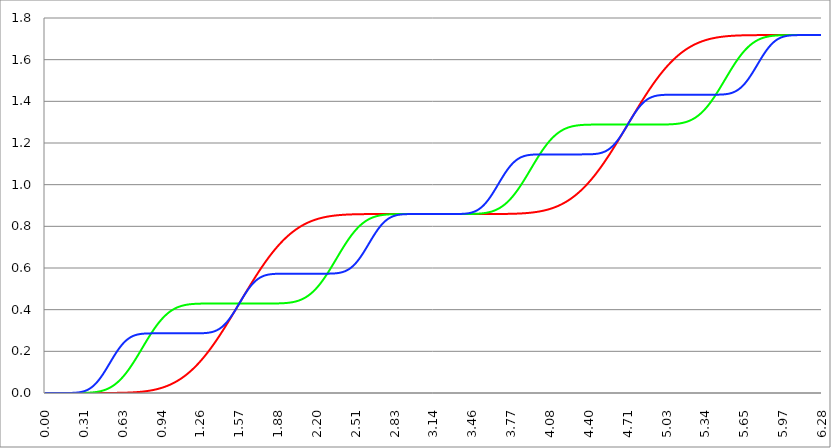
| Category | Series 1 | Series 0 | Series 2 |
|---|---|---|---|
| 0.0 | 0 | 0 | 0 |
| 0.00314159265358979 | 0 | 0 | 0 |
| 0.00628318530717958 | 0 | 0 | 0 |
| 0.00942477796076938 | 0 | 0 | 0 |
| 0.0125663706143592 | 0 | 0 | 0 |
| 0.015707963267949 | 0 | 0 | 0 |
| 0.0188495559215388 | 0 | 0 | 0 |
| 0.0219911485751285 | 0 | 0 | 0 |
| 0.0251327412287183 | 0 | 0 | 0 |
| 0.0282743338823081 | 0 | 0 | 0 |
| 0.0314159265358979 | 0 | 0 | 0 |
| 0.0345575191894877 | 0 | 0 | 0 |
| 0.0376991118430775 | 0 | 0 | 0 |
| 0.0408407044966673 | 0 | 0 | 0 |
| 0.0439822971502571 | 0 | 0 | 0 |
| 0.0471238898038469 | 0 | 0 | 0 |
| 0.0502654824574367 | 0 | 0 | 0 |
| 0.0534070751110265 | 0 | 0 | 0 |
| 0.0565486677646163 | 0 | 0 | 0 |
| 0.059690260418206 | 0 | 0 | 0 |
| 0.0628318530717958 | 0 | 0 | 0 |
| 0.0659734457253856 | 0 | 0 | 0 |
| 0.0691150383789754 | 0 | 0 | 0 |
| 0.0722566310325652 | 0 | 0 | 0 |
| 0.075398223686155 | 0 | 0 | 0 |
| 0.0785398163397448 | 0 | 0 | 0 |
| 0.0816814089933346 | 0 | 0 | 0 |
| 0.0848230016469244 | 0 | 0 | 0 |
| 0.0879645943005142 | 0 | 0 | 0 |
| 0.091106186954104 | 0 | 0 | 0 |
| 0.0942477796076937 | 0 | 0 | 0 |
| 0.0973893722612835 | 0 | 0 | 0 |
| 0.100530964914873 | 0 | 0 | 0 |
| 0.103672557568463 | 0 | 0 | 0 |
| 0.106814150222053 | 0 | 0 | 0 |
| 0.109955742875643 | 0 | 0 | 0 |
| 0.113097335529233 | 0 | 0 | 0 |
| 0.116238928182822 | 0 | 0 | 0 |
| 0.119380520836412 | 0 | 0 | 0 |
| 0.122522113490002 | 0 | 0 | 0 |
| 0.125663706143592 | 0 | 0 | 0 |
| 0.128805298797181 | 0 | 0 | 0 |
| 0.131946891450771 | 0 | 0 | 0 |
| 0.135088484104361 | 0 | 0 | 0 |
| 0.138230076757951 | 0 | 0 | 0 |
| 0.141371669411541 | 0 | 0 | 0 |
| 0.14451326206513 | 0 | 0 | 0 |
| 0.14765485471872 | 0 | 0 | 0 |
| 0.15079644737231 | 0 | 0 | 0 |
| 0.1539380400259 | 0 | 0 | 0 |
| 0.15707963267949 | 0 | 0 | 0 |
| 0.160221225333079 | 0 | 0 | 0 |
| 0.163362817986669 | 0 | 0 | 0 |
| 0.166504410640259 | 0 | 0 | 0 |
| 0.169646003293849 | 0 | 0 | 0 |
| 0.172787595947439 | 0 | 0 | 0 |
| 0.175929188601028 | 0 | 0 | 0 |
| 0.179070781254618 | 0 | 0 | 0 |
| 0.182212373908208 | 0 | 0 | 0 |
| 0.185353966561798 | 0 | 0 | 0 |
| 0.188495559215388 | 0 | 0 | 0 |
| 0.191637151868977 | 0 | 0 | 0 |
| 0.194778744522567 | 0 | 0 | 0 |
| 0.197920337176157 | 0 | 0 | 0 |
| 0.201061929829747 | 0 | 0 | 0 |
| 0.204203522483336 | 0 | 0 | 0 |
| 0.207345115136926 | 0 | 0 | 0 |
| 0.210486707790516 | 0 | 0 | 0 |
| 0.213628300444106 | 0 | 0 | 0 |
| 0.216769893097696 | 0 | 0 | 0 |
| 0.219911485751285 | 0 | 0 | 0.001 |
| 0.223053078404875 | 0 | 0 | 0.001 |
| 0.226194671058465 | 0 | 0 | 0.001 |
| 0.229336263712055 | 0 | 0 | 0.001 |
| 0.232477856365645 | 0 | 0 | 0.001 |
| 0.235619449019234 | 0 | 0 | 0.001 |
| 0.238761041672824 | 0 | 0 | 0.001 |
| 0.241902634326414 | 0 | 0 | 0.001 |
| 0.245044226980004 | 0 | 0 | 0.001 |
| 0.248185819633594 | 0 | 0 | 0.001 |
| 0.251327412287183 | 0 | 0 | 0.002 |
| 0.254469004940773 | 0 | 0 | 0.002 |
| 0.257610597594363 | 0 | 0 | 0.002 |
| 0.260752190247953 | 0 | 0 | 0.002 |
| 0.263893782901543 | 0 | 0 | 0.002 |
| 0.267035375555132 | 0 | 0 | 0.002 |
| 0.270176968208722 | 0 | 0 | 0.003 |
| 0.273318560862312 | 0 | 0 | 0.003 |
| 0.276460153515902 | 0 | 0 | 0.003 |
| 0.279601746169492 | 0 | 0 | 0.004 |
| 0.282743338823082 | 0 | 0 | 0.004 |
| 0.285884931476671 | 0 | 0 | 0.004 |
| 0.289026524130261 | 0 | 0 | 0.004 |
| 0.292168116783851 | 0 | 0 | 0.005 |
| 0.295309709437441 | 0 | 0 | 0.005 |
| 0.298451302091031 | 0 | 0 | 0.006 |
| 0.30159289474462 | 0 | 0 | 0.006 |
| 0.30473448739821 | 0 | 0 | 0.007 |
| 0.3078760800518 | 0 | 0 | 0.007 |
| 0.31101767270539 | 0 | 0.001 | 0.008 |
| 0.31415926535898 | 0 | 0.001 | 0.008 |
| 0.31730085801257 | 0 | 0.001 | 0.009 |
| 0.320442450666159 | 0 | 0.001 | 0.009 |
| 0.323584043319749 | 0 | 0.001 | 0.01 |
| 0.326725635973339 | 0 | 0.001 | 0.011 |
| 0.329867228626929 | 0 | 0.001 | 0.011 |
| 0.333008821280519 | 0 | 0.001 | 0.012 |
| 0.336150413934108 | 0 | 0.001 | 0.013 |
| 0.339292006587698 | 0 | 0.001 | 0.014 |
| 0.342433599241288 | 0 | 0.001 | 0.015 |
| 0.345575191894878 | 0 | 0.001 | 0.016 |
| 0.348716784548468 | 0 | 0.001 | 0.017 |
| 0.351858377202058 | 0 | 0.001 | 0.018 |
| 0.354999969855647 | 0 | 0.001 | 0.019 |
| 0.358141562509237 | 0 | 0.002 | 0.02 |
| 0.361283155162827 | 0 | 0.002 | 0.021 |
| 0.364424747816417 | 0 | 0.002 | 0.022 |
| 0.367566340470007 | 0 | 0.002 | 0.023 |
| 0.370707933123597 | 0 | 0.002 | 0.025 |
| 0.373849525777186 | 0 | 0.002 | 0.026 |
| 0.376991118430776 | 0 | 0.002 | 0.027 |
| 0.380132711084366 | 0 | 0.003 | 0.029 |
| 0.383274303737956 | 0 | 0.003 | 0.03 |
| 0.386415896391546 | 0 | 0.003 | 0.032 |
| 0.389557489045135 | 0 | 0.003 | 0.033 |
| 0.392699081698725 | 0 | 0.003 | 0.035 |
| 0.395840674352315 | 0 | 0.003 | 0.037 |
| 0.398982267005905 | 0 | 0.004 | 0.039 |
| 0.402123859659495 | 0 | 0.004 | 0.04 |
| 0.405265452313085 | 0 | 0.004 | 0.042 |
| 0.408407044966674 | 0 | 0.004 | 0.044 |
| 0.411548637620264 | 0 | 0.005 | 0.046 |
| 0.414690230273854 | 0 | 0.005 | 0.048 |
| 0.417831822927444 | 0 | 0.005 | 0.05 |
| 0.420973415581034 | 0 | 0.005 | 0.052 |
| 0.424115008234623 | 0 | 0.006 | 0.054 |
| 0.427256600888213 | 0 | 0.006 | 0.057 |
| 0.430398193541803 | 0 | 0.006 | 0.059 |
| 0.433539786195393 | 0 | 0.007 | 0.061 |
| 0.436681378848983 | 0 | 0.007 | 0.064 |
| 0.439822971502573 | 0 | 0.007 | 0.066 |
| 0.442964564156162 | 0 | 0.008 | 0.068 |
| 0.446106156809752 | 0 | 0.008 | 0.071 |
| 0.449247749463342 | 0 | 0.009 | 0.073 |
| 0.452389342116932 | 0 | 0.009 | 0.076 |
| 0.455530934770522 | 0 | 0.01 | 0.079 |
| 0.458672527424111 | 0 | 0.01 | 0.081 |
| 0.461814120077701 | 0 | 0.011 | 0.084 |
| 0.464955712731291 | 0 | 0.011 | 0.087 |
| 0.468097305384881 | 0 | 0.012 | 0.09 |
| 0.471238898038471 | 0 | 0.012 | 0.092 |
| 0.474380490692061 | 0 | 0.013 | 0.095 |
| 0.47752208334565 | 0 | 0.013 | 0.098 |
| 0.48066367599924 | 0 | 0.014 | 0.101 |
| 0.48380526865283 | 0 | 0.015 | 0.104 |
| 0.48694686130642 | 0 | 0.015 | 0.107 |
| 0.49008845396001 | 0 | 0.016 | 0.11 |
| 0.493230046613599 | 0 | 0.017 | 0.113 |
| 0.496371639267189 | 0 | 0.018 | 0.116 |
| 0.499513231920779 | 0 | 0.018 | 0.119 |
| 0.502654824574369 | 0 | 0.019 | 0.122 |
| 0.505796417227959 | 0 | 0.02 | 0.125 |
| 0.508938009881549 | 0 | 0.021 | 0.129 |
| 0.512079602535138 | 0 | 0.022 | 0.132 |
| 0.515221195188728 | 0 | 0.023 | 0.135 |
| 0.518362787842318 | 0 | 0.024 | 0.138 |
| 0.521504380495908 | 0 | 0.025 | 0.141 |
| 0.524645973149498 | 0 | 0.026 | 0.144 |
| 0.527787565803087 | 0 | 0.027 | 0.147 |
| 0.530929158456677 | 0 | 0.028 | 0.15 |
| 0.534070751110267 | 0 | 0.029 | 0.154 |
| 0.537212343763857 | 0 | 0.03 | 0.157 |
| 0.540353936417447 | 0 | 0.031 | 0.16 |
| 0.543495529071037 | 0 | 0.032 | 0.163 |
| 0.546637121724626 | 0 | 0.033 | 0.166 |
| 0.549778714378216 | 0 | 0.035 | 0.169 |
| 0.552920307031806 | 0 | 0.036 | 0.172 |
| 0.556061899685396 | 0 | 0.037 | 0.175 |
| 0.559203492338986 | 0 | 0.038 | 0.178 |
| 0.562345084992576 | 0 | 0.04 | 0.181 |
| 0.565486677646165 | 0 | 0.041 | 0.184 |
| 0.568628270299755 | 0 | 0.043 | 0.187 |
| 0.571769862953345 | 0.001 | 0.044 | 0.19 |
| 0.574911455606935 | 0.001 | 0.046 | 0.193 |
| 0.578053048260525 | 0.001 | 0.047 | 0.196 |
| 0.581194640914114 | 0.001 | 0.049 | 0.199 |
| 0.584336233567704 | 0.001 | 0.05 | 0.201 |
| 0.587477826221294 | 0.001 | 0.052 | 0.204 |
| 0.590619418874884 | 0.001 | 0.054 | 0.207 |
| 0.593761011528474 | 0.001 | 0.055 | 0.209 |
| 0.596902604182064 | 0.001 | 0.057 | 0.212 |
| 0.600044196835653 | 0.001 | 0.059 | 0.215 |
| 0.603185789489243 | 0.001 | 0.061 | 0.217 |
| 0.606327382142833 | 0.001 | 0.062 | 0.22 |
| 0.609468974796423 | 0.001 | 0.064 | 0.222 |
| 0.612610567450013 | 0.001 | 0.066 | 0.224 |
| 0.615752160103602 | 0.001 | 0.068 | 0.227 |
| 0.618893752757192 | 0.001 | 0.07 | 0.229 |
| 0.622035345410782 | 0.001 | 0.072 | 0.231 |
| 0.625176938064372 | 0.001 | 0.074 | 0.233 |
| 0.628318530717962 | 0.001 | 0.076 | 0.235 |
| 0.631460123371551 | 0.001 | 0.078 | 0.238 |
| 0.634601716025141 | 0.001 | 0.081 | 0.24 |
| 0.637743308678731 | 0.001 | 0.083 | 0.242 |
| 0.640884901332321 | 0.001 | 0.085 | 0.243 |
| 0.644026493985911 | 0.001 | 0.087 | 0.245 |
| 0.647168086639501 | 0.001 | 0.089 | 0.247 |
| 0.65030967929309 | 0.001 | 0.092 | 0.249 |
| 0.65345127194668 | 0.002 | 0.094 | 0.251 |
| 0.65659286460027 | 0.002 | 0.097 | 0.252 |
| 0.65973445725386 | 0.002 | 0.099 | 0.254 |
| 0.66287604990745 | 0.002 | 0.101 | 0.255 |
| 0.666017642561039 | 0.002 | 0.104 | 0.257 |
| 0.669159235214629 | 0.002 | 0.106 | 0.258 |
| 0.672300827868219 | 0.002 | 0.109 | 0.26 |
| 0.675442420521809 | 0.002 | 0.112 | 0.261 |
| 0.678584013175399 | 0.002 | 0.114 | 0.262 |
| 0.681725605828989 | 0.002 | 0.117 | 0.264 |
| 0.684867198482578 | 0.002 | 0.119 | 0.265 |
| 0.688008791136168 | 0.002 | 0.122 | 0.266 |
| 0.691150383789758 | 0.002 | 0.125 | 0.267 |
| 0.694291976443348 | 0.002 | 0.128 | 0.268 |
| 0.697433569096938 | 0.003 | 0.13 | 0.269 |
| 0.700575161750528 | 0.003 | 0.133 | 0.27 |
| 0.703716754404117 | 0.003 | 0.136 | 0.271 |
| 0.706858347057707 | 0.003 | 0.139 | 0.272 |
| 0.709999939711297 | 0.003 | 0.142 | 0.273 |
| 0.713141532364887 | 0.003 | 0.144 | 0.274 |
| 0.716283125018477 | 0.003 | 0.147 | 0.275 |
| 0.719424717672066 | 0.003 | 0.15 | 0.275 |
| 0.722566310325656 | 0.003 | 0.153 | 0.276 |
| 0.725707902979246 | 0.003 | 0.156 | 0.277 |
| 0.728849495632836 | 0.004 | 0.159 | 0.277 |
| 0.731991088286426 | 0.004 | 0.162 | 0.278 |
| 0.735132680940016 | 0.004 | 0.165 | 0.279 |
| 0.738274273593605 | 0.004 | 0.168 | 0.279 |
| 0.741415866247195 | 0.004 | 0.171 | 0.28 |
| 0.744557458900785 | 0.004 | 0.174 | 0.28 |
| 0.747699051554375 | 0.004 | 0.177 | 0.281 |
| 0.750840644207965 | 0.005 | 0.18 | 0.281 |
| 0.753982236861554 | 0.005 | 0.184 | 0.281 |
| 0.757123829515144 | 0.005 | 0.187 | 0.282 |
| 0.760265422168734 | 0.005 | 0.19 | 0.282 |
| 0.763407014822324 | 0.005 | 0.193 | 0.282 |
| 0.766548607475914 | 0.005 | 0.196 | 0.283 |
| 0.769690200129504 | 0.006 | 0.199 | 0.283 |
| 0.772831792783093 | 0.006 | 0.202 | 0.283 |
| 0.775973385436683 | 0.006 | 0.205 | 0.284 |
| 0.779114978090273 | 0.006 | 0.208 | 0.284 |
| 0.782256570743863 | 0.006 | 0.212 | 0.284 |
| 0.785398163397453 | 0.006 | 0.215 | 0.284 |
| 0.788539756051042 | 0.007 | 0.218 | 0.284 |
| 0.791681348704632 | 0.007 | 0.221 | 0.285 |
| 0.794822941358222 | 0.007 | 0.224 | 0.285 |
| 0.797964534011812 | 0.007 | 0.227 | 0.285 |
| 0.801106126665402 | 0.007 | 0.23 | 0.285 |
| 0.804247719318992 | 0.008 | 0.234 | 0.285 |
| 0.807389311972581 | 0.008 | 0.237 | 0.285 |
| 0.810530904626171 | 0.008 | 0.24 | 0.285 |
| 0.813672497279761 | 0.008 | 0.243 | 0.285 |
| 0.816814089933351 | 0.009 | 0.246 | 0.286 |
| 0.819955682586941 | 0.009 | 0.249 | 0.286 |
| 0.823097275240531 | 0.009 | 0.252 | 0.286 |
| 0.82623886789412 | 0.009 | 0.255 | 0.286 |
| 0.82938046054771 | 0.01 | 0.258 | 0.286 |
| 0.8325220532013 | 0.01 | 0.261 | 0.286 |
| 0.83566364585489 | 0.01 | 0.264 | 0.286 |
| 0.83880523850848 | 0.011 | 0.267 | 0.286 |
| 0.841946831162069 | 0.011 | 0.27 | 0.286 |
| 0.845088423815659 | 0.011 | 0.273 | 0.286 |
| 0.848230016469249 | 0.011 | 0.276 | 0.286 |
| 0.851371609122839 | 0.012 | 0.279 | 0.286 |
| 0.854513201776429 | 0.012 | 0.282 | 0.286 |
| 0.857654794430019 | 0.012 | 0.285 | 0.286 |
| 0.860796387083608 | 0.013 | 0.288 | 0.286 |
| 0.863937979737198 | 0.013 | 0.291 | 0.286 |
| 0.867079572390788 | 0.013 | 0.294 | 0.286 |
| 0.870221165044378 | 0.014 | 0.296 | 0.286 |
| 0.873362757697968 | 0.014 | 0.299 | 0.286 |
| 0.876504350351557 | 0.015 | 0.302 | 0.286 |
| 0.879645943005147 | 0.015 | 0.305 | 0.286 |
| 0.882787535658737 | 0.015 | 0.307 | 0.286 |
| 0.885929128312327 | 0.016 | 0.31 | 0.286 |
| 0.889070720965917 | 0.016 | 0.313 | 0.286 |
| 0.892212313619507 | 0.017 | 0.315 | 0.286 |
| 0.895353906273096 | 0.017 | 0.318 | 0.286 |
| 0.898495498926686 | 0.017 | 0.321 | 0.286 |
| 0.901637091580276 | 0.018 | 0.323 | 0.286 |
| 0.904778684233866 | 0.018 | 0.326 | 0.286 |
| 0.907920276887456 | 0.019 | 0.328 | 0.286 |
| 0.911061869541045 | 0.019 | 0.331 | 0.286 |
| 0.914203462194635 | 0.02 | 0.333 | 0.286 |
| 0.917345054848225 | 0.02 | 0.335 | 0.286 |
| 0.920486647501815 | 0.021 | 0.338 | 0.286 |
| 0.923628240155405 | 0.021 | 0.34 | 0.286 |
| 0.926769832808995 | 0.022 | 0.342 | 0.286 |
| 0.929911425462584 | 0.022 | 0.345 | 0.286 |
| 0.933053018116174 | 0.023 | 0.347 | 0.286 |
| 0.936194610769764 | 0.023 | 0.349 | 0.286 |
| 0.939336203423354 | 0.024 | 0.351 | 0.286 |
| 0.942477796076944 | 0.025 | 0.353 | 0.286 |
| 0.945619388730533 | 0.025 | 0.355 | 0.286 |
| 0.948760981384123 | 0.026 | 0.357 | 0.286 |
| 0.951902574037713 | 0.026 | 0.359 | 0.286 |
| 0.955044166691303 | 0.027 | 0.361 | 0.286 |
| 0.958185759344893 | 0.028 | 0.363 | 0.286 |
| 0.961327351998483 | 0.028 | 0.365 | 0.286 |
| 0.964468944652072 | 0.029 | 0.367 | 0.286 |
| 0.967610537305662 | 0.03 | 0.369 | 0.286 |
| 0.970752129959252 | 0.03 | 0.371 | 0.286 |
| 0.973893722612842 | 0.031 | 0.373 | 0.286 |
| 0.977035315266432 | 0.032 | 0.374 | 0.286 |
| 0.980176907920022 | 0.032 | 0.376 | 0.286 |
| 0.983318500573611 | 0.033 | 0.378 | 0.286 |
| 0.986460093227201 | 0.034 | 0.379 | 0.286 |
| 0.989601685880791 | 0.034 | 0.381 | 0.286 |
| 0.992743278534381 | 0.035 | 0.382 | 0.286 |
| 0.995884871187971 | 0.036 | 0.384 | 0.286 |
| 0.99902646384156 | 0.037 | 0.385 | 0.286 |
| 1.00216805649515 | 0.038 | 0.387 | 0.286 |
| 1.00530964914874 | 0.038 | 0.388 | 0.286 |
| 1.00845124180233 | 0.039 | 0.39 | 0.286 |
| 1.01159283445592 | 0.04 | 0.391 | 0.286 |
| 1.01473442710951 | 0.041 | 0.392 | 0.286 |
| 1.017876019763099 | 0.042 | 0.394 | 0.286 |
| 1.021017612416689 | 0.043 | 0.395 | 0.286 |
| 1.02415920507028 | 0.043 | 0.396 | 0.286 |
| 1.027300797723869 | 0.044 | 0.397 | 0.286 |
| 1.030442390377459 | 0.045 | 0.399 | 0.286 |
| 1.033583983031048 | 0.046 | 0.4 | 0.286 |
| 1.036725575684638 | 0.047 | 0.401 | 0.286 |
| 1.039867168338228 | 0.048 | 0.402 | 0.286 |
| 1.043008760991818 | 0.049 | 0.403 | 0.286 |
| 1.046150353645408 | 0.05 | 0.404 | 0.286 |
| 1.049291946298998 | 0.051 | 0.405 | 0.286 |
| 1.052433538952587 | 0.052 | 0.406 | 0.286 |
| 1.055575131606177 | 0.053 | 0.407 | 0.286 |
| 1.058716724259767 | 0.054 | 0.408 | 0.286 |
| 1.061858316913357 | 0.055 | 0.409 | 0.286 |
| 1.064999909566947 | 0.056 | 0.41 | 0.286 |
| 1.068141502220536 | 0.057 | 0.41 | 0.286 |
| 1.071283094874126 | 0.058 | 0.411 | 0.286 |
| 1.074424687527716 | 0.06 | 0.412 | 0.286 |
| 1.077566280181306 | 0.061 | 0.413 | 0.286 |
| 1.080707872834896 | 0.062 | 0.413 | 0.286 |
| 1.083849465488486 | 0.063 | 0.414 | 0.286 |
| 1.086991058142075 | 0.064 | 0.415 | 0.286 |
| 1.090132650795665 | 0.065 | 0.415 | 0.286 |
| 1.093274243449255 | 0.067 | 0.416 | 0.286 |
| 1.096415836102845 | 0.068 | 0.417 | 0.286 |
| 1.099557428756435 | 0.069 | 0.417 | 0.286 |
| 1.102699021410025 | 0.07 | 0.418 | 0.286 |
| 1.105840614063614 | 0.072 | 0.418 | 0.286 |
| 1.108982206717204 | 0.073 | 0.419 | 0.286 |
| 1.112123799370794 | 0.074 | 0.419 | 0.286 |
| 1.115265392024384 | 0.075 | 0.42 | 0.286 |
| 1.118406984677974 | 0.077 | 0.42 | 0.286 |
| 1.121548577331563 | 0.078 | 0.421 | 0.286 |
| 1.124690169985153 | 0.08 | 0.421 | 0.286 |
| 1.127831762638743 | 0.081 | 0.422 | 0.286 |
| 1.130973355292333 | 0.082 | 0.422 | 0.286 |
| 1.134114947945923 | 0.084 | 0.422 | 0.286 |
| 1.137256540599513 | 0.085 | 0.423 | 0.286 |
| 1.140398133253102 | 0.087 | 0.423 | 0.286 |
| 1.143539725906692 | 0.088 | 0.423 | 0.286 |
| 1.146681318560282 | 0.09 | 0.424 | 0.286 |
| 1.149822911213872 | 0.091 | 0.424 | 0.286 |
| 1.152964503867462 | 0.093 | 0.424 | 0.286 |
| 1.156106096521051 | 0.094 | 0.425 | 0.286 |
| 1.159247689174641 | 0.096 | 0.425 | 0.286 |
| 1.162389281828231 | 0.097 | 0.425 | 0.286 |
| 1.165530874481821 | 0.099 | 0.425 | 0.286 |
| 1.168672467135411 | 0.1 | 0.426 | 0.286 |
| 1.171814059789001 | 0.102 | 0.426 | 0.286 |
| 1.17495565244259 | 0.104 | 0.426 | 0.286 |
| 1.17809724509618 | 0.105 | 0.426 | 0.286 |
| 1.18123883774977 | 0.107 | 0.426 | 0.286 |
| 1.18438043040336 | 0.109 | 0.427 | 0.286 |
| 1.18752202305695 | 0.11 | 0.427 | 0.286 |
| 1.190663615710539 | 0.112 | 0.427 | 0.286 |
| 1.193805208364129 | 0.114 | 0.427 | 0.286 |
| 1.19694680101772 | 0.116 | 0.427 | 0.286 |
| 1.200088393671309 | 0.118 | 0.427 | 0.286 |
| 1.203229986324899 | 0.119 | 0.428 | 0.286 |
| 1.206371578978489 | 0.121 | 0.428 | 0.286 |
| 1.209513171632078 | 0.123 | 0.428 | 0.286 |
| 1.212654764285668 | 0.125 | 0.428 | 0.286 |
| 1.215796356939258 | 0.127 | 0.428 | 0.286 |
| 1.218937949592848 | 0.129 | 0.428 | 0.286 |
| 1.222079542246438 | 0.13 | 0.428 | 0.286 |
| 1.225221134900027 | 0.132 | 0.428 | 0.286 |
| 1.228362727553617 | 0.134 | 0.428 | 0.286 |
| 1.231504320207207 | 0.136 | 0.428 | 0.286 |
| 1.234645912860797 | 0.138 | 0.429 | 0.286 |
| 1.237787505514387 | 0.14 | 0.429 | 0.287 |
| 1.240929098167977 | 0.142 | 0.429 | 0.287 |
| 1.244070690821566 | 0.144 | 0.429 | 0.287 |
| 1.247212283475156 | 0.146 | 0.429 | 0.287 |
| 1.250353876128746 | 0.148 | 0.429 | 0.287 |
| 1.253495468782336 | 0.15 | 0.429 | 0.287 |
| 1.256637061435926 | 0.153 | 0.429 | 0.287 |
| 1.259778654089515 | 0.155 | 0.429 | 0.287 |
| 1.262920246743105 | 0.157 | 0.429 | 0.287 |
| 1.266061839396695 | 0.159 | 0.429 | 0.287 |
| 1.269203432050285 | 0.161 | 0.429 | 0.287 |
| 1.272345024703875 | 0.163 | 0.429 | 0.287 |
| 1.275486617357465 | 0.165 | 0.429 | 0.287 |
| 1.278628210011054 | 0.168 | 0.429 | 0.287 |
| 1.281769802664644 | 0.17 | 0.429 | 0.287 |
| 1.284911395318234 | 0.172 | 0.429 | 0.287 |
| 1.288052987971824 | 0.174 | 0.429 | 0.287 |
| 1.291194580625414 | 0.177 | 0.429 | 0.288 |
| 1.294336173279003 | 0.179 | 0.429 | 0.288 |
| 1.297477765932593 | 0.181 | 0.429 | 0.288 |
| 1.300619358586183 | 0.184 | 0.429 | 0.288 |
| 1.303760951239773 | 0.186 | 0.429 | 0.288 |
| 1.306902543893363 | 0.188 | 0.429 | 0.288 |
| 1.310044136546953 | 0.191 | 0.429 | 0.289 |
| 1.313185729200542 | 0.193 | 0.429 | 0.289 |
| 1.316327321854132 | 0.196 | 0.429 | 0.289 |
| 1.319468914507722 | 0.198 | 0.429 | 0.289 |
| 1.322610507161312 | 0.2 | 0.429 | 0.289 |
| 1.325752099814902 | 0.203 | 0.429 | 0.29 |
| 1.328893692468491 | 0.205 | 0.429 | 0.29 |
| 1.332035285122081 | 0.208 | 0.429 | 0.29 |
| 1.335176877775671 | 0.21 | 0.429 | 0.291 |
| 1.338318470429261 | 0.213 | 0.429 | 0.291 |
| 1.341460063082851 | 0.215 | 0.429 | 0.291 |
| 1.344601655736441 | 0.218 | 0.429 | 0.292 |
| 1.34774324839003 | 0.22 | 0.429 | 0.292 |
| 1.35088484104362 | 0.223 | 0.429 | 0.293 |
| 1.35402643369721 | 0.226 | 0.429 | 0.293 |
| 1.3571680263508 | 0.228 | 0.429 | 0.294 |
| 1.36030961900439 | 0.231 | 0.429 | 0.294 |
| 1.363451211657979 | 0.234 | 0.429 | 0.295 |
| 1.36659280431157 | 0.236 | 0.429 | 0.296 |
| 1.369734396965159 | 0.239 | 0.43 | 0.296 |
| 1.372875989618749 | 0.241 | 0.43 | 0.297 |
| 1.376017582272339 | 0.244 | 0.43 | 0.298 |
| 1.379159174925929 | 0.247 | 0.43 | 0.298 |
| 1.382300767579518 | 0.25 | 0.43 | 0.299 |
| 1.385442360233108 | 0.252 | 0.43 | 0.3 |
| 1.388583952886698 | 0.255 | 0.43 | 0.301 |
| 1.391725545540288 | 0.258 | 0.43 | 0.302 |
| 1.394867138193878 | 0.261 | 0.43 | 0.303 |
| 1.398008730847468 | 0.263 | 0.43 | 0.304 |
| 1.401150323501057 | 0.266 | 0.43 | 0.305 |
| 1.404291916154647 | 0.269 | 0.43 | 0.306 |
| 1.407433508808237 | 0.272 | 0.43 | 0.307 |
| 1.410575101461827 | 0.275 | 0.43 | 0.308 |
| 1.413716694115417 | 0.277 | 0.43 | 0.309 |
| 1.416858286769006 | 0.28 | 0.43 | 0.311 |
| 1.419999879422596 | 0.283 | 0.43 | 0.312 |
| 1.423141472076186 | 0.286 | 0.43 | 0.313 |
| 1.426283064729776 | 0.289 | 0.43 | 0.315 |
| 1.429424657383366 | 0.292 | 0.43 | 0.316 |
| 1.432566250036956 | 0.295 | 0.43 | 0.318 |
| 1.435707842690545 | 0.298 | 0.43 | 0.319 |
| 1.438849435344135 | 0.301 | 0.43 | 0.321 |
| 1.441991027997725 | 0.304 | 0.43 | 0.323 |
| 1.445132620651315 | 0.306 | 0.43 | 0.324 |
| 1.448274213304905 | 0.309 | 0.43 | 0.326 |
| 1.451415805958494 | 0.312 | 0.43 | 0.328 |
| 1.454557398612084 | 0.315 | 0.43 | 0.33 |
| 1.457698991265674 | 0.318 | 0.43 | 0.332 |
| 1.460840583919264 | 0.321 | 0.43 | 0.334 |
| 1.463982176572854 | 0.324 | 0.43 | 0.336 |
| 1.467123769226444 | 0.327 | 0.43 | 0.338 |
| 1.470265361880033 | 0.33 | 0.43 | 0.34 |
| 1.473406954533623 | 0.333 | 0.43 | 0.342 |
| 1.476548547187213 | 0.336 | 0.43 | 0.344 |
| 1.479690139840803 | 0.339 | 0.43 | 0.347 |
| 1.482831732494393 | 0.342 | 0.43 | 0.349 |
| 1.485973325147982 | 0.345 | 0.43 | 0.352 |
| 1.489114917801572 | 0.349 | 0.43 | 0.354 |
| 1.492256510455162 | 0.352 | 0.43 | 0.356 |
| 1.495398103108752 | 0.355 | 0.43 | 0.359 |
| 1.498539695762342 | 0.358 | 0.43 | 0.362 |
| 1.501681288415932 | 0.361 | 0.43 | 0.364 |
| 1.504822881069521 | 0.364 | 0.43 | 0.367 |
| 1.507964473723111 | 0.367 | 0.43 | 0.37 |
| 1.511106066376701 | 0.37 | 0.43 | 0.372 |
| 1.514247659030291 | 0.373 | 0.43 | 0.375 |
| 1.517389251683881 | 0.376 | 0.43 | 0.378 |
| 1.520530844337471 | 0.379 | 0.43 | 0.381 |
| 1.52367243699106 | 0.383 | 0.43 | 0.384 |
| 1.52681402964465 | 0.386 | 0.43 | 0.387 |
| 1.52995562229824 | 0.389 | 0.43 | 0.389 |
| 1.53309721495183 | 0.392 | 0.43 | 0.392 |
| 1.53623880760542 | 0.395 | 0.43 | 0.395 |
| 1.539380400259009 | 0.398 | 0.43 | 0.398 |
| 1.542521992912599 | 0.401 | 0.43 | 0.402 |
| 1.545663585566189 | 0.404 | 0.43 | 0.405 |
| 1.548805178219779 | 0.408 | 0.43 | 0.408 |
| 1.551946770873369 | 0.411 | 0.43 | 0.411 |
| 1.555088363526959 | 0.414 | 0.43 | 0.414 |
| 1.558229956180548 | 0.417 | 0.43 | 0.417 |
| 1.561371548834138 | 0.42 | 0.43 | 0.42 |
| 1.564513141487728 | 0.423 | 0.43 | 0.423 |
| 1.567654734141318 | 0.426 | 0.43 | 0.426 |
| 1.570796326794908 | 0.43 | 0.43 | 0.43 |
| 1.573937919448497 | 0.433 | 0.43 | 0.433 |
| 1.577079512102087 | 0.436 | 0.43 | 0.436 |
| 1.580221104755677 | 0.439 | 0.43 | 0.439 |
| 1.583362697409267 | 0.442 | 0.43 | 0.442 |
| 1.586504290062857 | 0.445 | 0.43 | 0.445 |
| 1.589645882716447 | 0.448 | 0.43 | 0.448 |
| 1.592787475370036 | 0.451 | 0.43 | 0.451 |
| 1.595929068023626 | 0.455 | 0.43 | 0.454 |
| 1.599070660677216 | 0.458 | 0.43 | 0.458 |
| 1.602212253330806 | 0.461 | 0.43 | 0.461 |
| 1.605353845984396 | 0.464 | 0.43 | 0.464 |
| 1.608495438637985 | 0.467 | 0.43 | 0.467 |
| 1.611637031291575 | 0.47 | 0.43 | 0.47 |
| 1.614778623945165 | 0.473 | 0.43 | 0.472 |
| 1.617920216598755 | 0.476 | 0.43 | 0.475 |
| 1.621061809252345 | 0.48 | 0.43 | 0.478 |
| 1.624203401905935 | 0.483 | 0.43 | 0.481 |
| 1.627344994559524 | 0.486 | 0.43 | 0.484 |
| 1.630486587213114 | 0.489 | 0.43 | 0.487 |
| 1.633628179866704 | 0.492 | 0.43 | 0.489 |
| 1.636769772520294 | 0.495 | 0.43 | 0.492 |
| 1.639911365173884 | 0.498 | 0.43 | 0.495 |
| 1.643052957827473 | 0.501 | 0.43 | 0.497 |
| 1.646194550481063 | 0.504 | 0.43 | 0.5 |
| 1.649336143134653 | 0.507 | 0.43 | 0.503 |
| 1.652477735788243 | 0.51 | 0.43 | 0.505 |
| 1.655619328441833 | 0.514 | 0.43 | 0.508 |
| 1.658760921095423 | 0.517 | 0.43 | 0.51 |
| 1.661902513749012 | 0.52 | 0.43 | 0.512 |
| 1.665044106402602 | 0.523 | 0.43 | 0.515 |
| 1.668185699056192 | 0.526 | 0.43 | 0.517 |
| 1.671327291709782 | 0.529 | 0.43 | 0.519 |
| 1.674468884363372 | 0.532 | 0.43 | 0.521 |
| 1.677610477016961 | 0.535 | 0.43 | 0.523 |
| 1.680752069670551 | 0.538 | 0.43 | 0.525 |
| 1.683893662324141 | 0.541 | 0.43 | 0.527 |
| 1.687035254977731 | 0.544 | 0.43 | 0.529 |
| 1.690176847631321 | 0.547 | 0.43 | 0.531 |
| 1.693318440284911 | 0.55 | 0.43 | 0.533 |
| 1.6964600329385 | 0.553 | 0.43 | 0.535 |
| 1.69960162559209 | 0.556 | 0.43 | 0.536 |
| 1.70274321824568 | 0.558 | 0.43 | 0.538 |
| 1.70588481089927 | 0.561 | 0.43 | 0.54 |
| 1.70902640355286 | 0.564 | 0.43 | 0.541 |
| 1.712167996206449 | 0.567 | 0.43 | 0.543 |
| 1.715309588860039 | 0.57 | 0.43 | 0.544 |
| 1.71845118151363 | 0.573 | 0.43 | 0.546 |
| 1.721592774167219 | 0.576 | 0.43 | 0.547 |
| 1.724734366820809 | 0.579 | 0.43 | 0.548 |
| 1.727875959474399 | 0.582 | 0.43 | 0.55 |
| 1.731017552127988 | 0.584 | 0.43 | 0.551 |
| 1.734159144781578 | 0.587 | 0.43 | 0.552 |
| 1.737300737435168 | 0.59 | 0.43 | 0.553 |
| 1.740442330088758 | 0.593 | 0.43 | 0.554 |
| 1.743583922742348 | 0.596 | 0.43 | 0.555 |
| 1.746725515395937 | 0.598 | 0.43 | 0.556 |
| 1.749867108049527 | 0.601 | 0.43 | 0.557 |
| 1.753008700703117 | 0.604 | 0.43 | 0.558 |
| 1.756150293356707 | 0.607 | 0.43 | 0.559 |
| 1.759291886010297 | 0.609 | 0.43 | 0.56 |
| 1.762433478663887 | 0.612 | 0.43 | 0.561 |
| 1.765575071317476 | 0.615 | 0.43 | 0.561 |
| 1.768716663971066 | 0.618 | 0.43 | 0.562 |
| 1.771858256624656 | 0.62 | 0.43 | 0.563 |
| 1.774999849278246 | 0.623 | 0.43 | 0.563 |
| 1.778141441931836 | 0.626 | 0.43 | 0.564 |
| 1.781283034585426 | 0.628 | 0.43 | 0.565 |
| 1.784424627239015 | 0.631 | 0.43 | 0.565 |
| 1.787566219892605 | 0.633 | 0.43 | 0.566 |
| 1.790707812546195 | 0.636 | 0.43 | 0.566 |
| 1.793849405199785 | 0.639 | 0.43 | 0.567 |
| 1.796990997853375 | 0.641 | 0.43 | 0.567 |
| 1.800132590506964 | 0.644 | 0.43 | 0.568 |
| 1.803274183160554 | 0.646 | 0.43 | 0.568 |
| 1.806415775814144 | 0.649 | 0.43 | 0.568 |
| 1.809557368467734 | 0.651 | 0.43 | 0.569 |
| 1.812698961121324 | 0.654 | 0.43 | 0.569 |
| 1.815840553774914 | 0.656 | 0.43 | 0.569 |
| 1.818982146428503 | 0.659 | 0.43 | 0.57 |
| 1.822123739082093 | 0.661 | 0.43 | 0.57 |
| 1.825265331735683 | 0.664 | 0.43 | 0.57 |
| 1.828406924389273 | 0.666 | 0.43 | 0.57 |
| 1.831548517042863 | 0.668 | 0.43 | 0.57 |
| 1.834690109696452 | 0.671 | 0.43 | 0.571 |
| 1.837831702350042 | 0.673 | 0.43 | 0.571 |
| 1.840973295003632 | 0.675 | 0.43 | 0.571 |
| 1.844114887657222 | 0.678 | 0.43 | 0.571 |
| 1.847256480310812 | 0.68 | 0.43 | 0.571 |
| 1.850398072964402 | 0.682 | 0.43 | 0.571 |
| 1.853539665617991 | 0.685 | 0.43 | 0.572 |
| 1.856681258271581 | 0.687 | 0.43 | 0.572 |
| 1.859822850925171 | 0.689 | 0.43 | 0.572 |
| 1.862964443578761 | 0.691 | 0.43 | 0.572 |
| 1.866106036232351 | 0.694 | 0.43 | 0.572 |
| 1.86924762888594 | 0.696 | 0.43 | 0.572 |
| 1.87238922153953 | 0.698 | 0.43 | 0.572 |
| 1.87553081419312 | 0.7 | 0.43 | 0.572 |
| 1.87867240684671 | 0.702 | 0.43 | 0.572 |
| 1.8818139995003 | 0.704 | 0.43 | 0.572 |
| 1.88495559215389 | 0.706 | 0.43 | 0.572 |
| 1.888097184807479 | 0.709 | 0.43 | 0.572 |
| 1.891238777461069 | 0.711 | 0.43 | 0.572 |
| 1.89438037011466 | 0.713 | 0.43 | 0.572 |
| 1.897521962768249 | 0.715 | 0.43 | 0.572 |
| 1.900663555421839 | 0.717 | 0.43 | 0.572 |
| 1.903805148075429 | 0.719 | 0.43 | 0.573 |
| 1.906946740729018 | 0.721 | 0.43 | 0.573 |
| 1.910088333382608 | 0.723 | 0.431 | 0.573 |
| 1.913229926036198 | 0.725 | 0.431 | 0.573 |
| 1.916371518689788 | 0.727 | 0.431 | 0.573 |
| 1.919513111343378 | 0.729 | 0.431 | 0.573 |
| 1.922654703996967 | 0.73 | 0.431 | 0.573 |
| 1.925796296650557 | 0.732 | 0.431 | 0.573 |
| 1.928937889304147 | 0.734 | 0.431 | 0.573 |
| 1.932079481957737 | 0.736 | 0.431 | 0.573 |
| 1.935221074611327 | 0.738 | 0.431 | 0.573 |
| 1.938362667264917 | 0.74 | 0.431 | 0.573 |
| 1.941504259918506 | 0.742 | 0.432 | 0.573 |
| 1.944645852572096 | 0.743 | 0.432 | 0.573 |
| 1.947787445225686 | 0.745 | 0.432 | 0.573 |
| 1.950929037879276 | 0.747 | 0.432 | 0.573 |
| 1.954070630532866 | 0.749 | 0.432 | 0.573 |
| 1.957212223186455 | 0.75 | 0.432 | 0.573 |
| 1.960353815840045 | 0.752 | 0.433 | 0.573 |
| 1.963495408493635 | 0.754 | 0.433 | 0.573 |
| 1.966637001147225 | 0.755 | 0.433 | 0.573 |
| 1.969778593800815 | 0.757 | 0.433 | 0.573 |
| 1.972920186454405 | 0.759 | 0.433 | 0.573 |
| 1.976061779107994 | 0.76 | 0.434 | 0.573 |
| 1.979203371761584 | 0.762 | 0.434 | 0.573 |
| 1.982344964415174 | 0.763 | 0.434 | 0.573 |
| 1.985486557068764 | 0.765 | 0.434 | 0.573 |
| 1.988628149722354 | 0.766 | 0.435 | 0.573 |
| 1.991769742375943 | 0.768 | 0.435 | 0.573 |
| 1.994911335029533 | 0.769 | 0.435 | 0.573 |
| 1.998052927683123 | 0.771 | 0.436 | 0.573 |
| 2.001194520336712 | 0.772 | 0.436 | 0.573 |
| 2.004336112990302 | 0.774 | 0.436 | 0.573 |
| 2.007477705643892 | 0.775 | 0.437 | 0.573 |
| 2.010619298297482 | 0.777 | 0.437 | 0.573 |
| 2.013760890951071 | 0.778 | 0.437 | 0.573 |
| 2.016902483604661 | 0.779 | 0.438 | 0.573 |
| 2.02004407625825 | 0.781 | 0.438 | 0.573 |
| 2.02318566891184 | 0.782 | 0.439 | 0.573 |
| 2.02632726156543 | 0.784 | 0.439 | 0.573 |
| 2.029468854219019 | 0.785 | 0.44 | 0.573 |
| 2.032610446872609 | 0.786 | 0.44 | 0.573 |
| 2.035752039526198 | 0.787 | 0.441 | 0.573 |
| 2.038893632179788 | 0.789 | 0.441 | 0.573 |
| 2.042035224833378 | 0.79 | 0.442 | 0.573 |
| 2.045176817486967 | 0.791 | 0.442 | 0.573 |
| 2.048318410140557 | 0.792 | 0.443 | 0.573 |
| 2.051460002794146 | 0.794 | 0.444 | 0.573 |
| 2.054601595447736 | 0.795 | 0.444 | 0.573 |
| 2.057743188101325 | 0.796 | 0.445 | 0.573 |
| 2.060884780754915 | 0.797 | 0.446 | 0.573 |
| 2.064026373408505 | 0.798 | 0.446 | 0.573 |
| 2.067167966062094 | 0.799 | 0.447 | 0.573 |
| 2.070309558715684 | 0.801 | 0.448 | 0.573 |
| 2.073451151369273 | 0.802 | 0.449 | 0.573 |
| 2.076592744022863 | 0.803 | 0.45 | 0.573 |
| 2.079734336676452 | 0.804 | 0.45 | 0.573 |
| 2.082875929330042 | 0.805 | 0.451 | 0.573 |
| 2.086017521983632 | 0.806 | 0.452 | 0.573 |
| 2.089159114637221 | 0.807 | 0.453 | 0.573 |
| 2.092300707290811 | 0.808 | 0.454 | 0.573 |
| 2.095442299944401 | 0.809 | 0.455 | 0.573 |
| 2.09858389259799 | 0.81 | 0.456 | 0.573 |
| 2.10172548525158 | 0.811 | 0.457 | 0.573 |
| 2.104867077905169 | 0.812 | 0.458 | 0.573 |
| 2.108008670558759 | 0.813 | 0.459 | 0.573 |
| 2.111150263212349 | 0.814 | 0.46 | 0.573 |
| 2.114291855865938 | 0.815 | 0.462 | 0.573 |
| 2.117433448519528 | 0.816 | 0.463 | 0.573 |
| 2.120575041173117 | 0.816 | 0.464 | 0.573 |
| 2.123716633826707 | 0.817 | 0.465 | 0.573 |
| 2.126858226480297 | 0.818 | 0.467 | 0.573 |
| 2.129999819133886 | 0.819 | 0.468 | 0.573 |
| 2.133141411787476 | 0.82 | 0.469 | 0.573 |
| 2.136283004441065 | 0.821 | 0.471 | 0.573 |
| 2.139424597094655 | 0.821 | 0.472 | 0.573 |
| 2.142566189748245 | 0.822 | 0.474 | 0.573 |
| 2.145707782401834 | 0.823 | 0.475 | 0.573 |
| 2.148849375055424 | 0.824 | 0.477 | 0.573 |
| 2.151990967709013 | 0.825 | 0.478 | 0.573 |
| 2.155132560362603 | 0.825 | 0.48 | 0.573 |
| 2.158274153016193 | 0.826 | 0.481 | 0.573 |
| 2.161415745669782 | 0.827 | 0.483 | 0.573 |
| 2.164557338323372 | 0.827 | 0.485 | 0.573 |
| 2.167698930976961 | 0.828 | 0.486 | 0.573 |
| 2.170840523630551 | 0.829 | 0.488 | 0.573 |
| 2.173982116284141 | 0.829 | 0.49 | 0.573 |
| 2.17712370893773 | 0.83 | 0.492 | 0.573 |
| 2.18026530159132 | 0.831 | 0.494 | 0.573 |
| 2.183406894244909 | 0.831 | 0.496 | 0.573 |
| 2.186548486898499 | 0.832 | 0.498 | 0.573 |
| 2.189690079552089 | 0.833 | 0.5 | 0.573 |
| 2.192831672205678 | 0.833 | 0.502 | 0.573 |
| 2.195973264859268 | 0.834 | 0.504 | 0.573 |
| 2.199114857512857 | 0.834 | 0.506 | 0.573 |
| 2.202256450166447 | 0.835 | 0.508 | 0.573 |
| 2.205398042820036 | 0.836 | 0.51 | 0.573 |
| 2.208539635473626 | 0.836 | 0.512 | 0.573 |
| 2.211681228127216 | 0.837 | 0.514 | 0.573 |
| 2.214822820780805 | 0.837 | 0.517 | 0.573 |
| 2.217964413434395 | 0.838 | 0.519 | 0.573 |
| 2.221106006087984 | 0.838 | 0.521 | 0.573 |
| 2.224247598741574 | 0.839 | 0.524 | 0.573 |
| 2.227389191395164 | 0.839 | 0.526 | 0.573 |
| 2.230530784048753 | 0.84 | 0.528 | 0.573 |
| 2.233672376702343 | 0.84 | 0.531 | 0.573 |
| 2.236813969355933 | 0.841 | 0.533 | 0.573 |
| 2.239955562009522 | 0.841 | 0.536 | 0.573 |
| 2.243097154663112 | 0.842 | 0.538 | 0.573 |
| 2.246238747316701 | 0.842 | 0.541 | 0.573 |
| 2.249380339970291 | 0.842 | 0.544 | 0.573 |
| 2.252521932623881 | 0.843 | 0.546 | 0.573 |
| 2.25566352527747 | 0.843 | 0.549 | 0.573 |
| 2.25880511793106 | 0.844 | 0.552 | 0.573 |
| 2.261946710584649 | 0.844 | 0.554 | 0.573 |
| 2.265088303238239 | 0.844 | 0.557 | 0.573 |
| 2.268229895891829 | 0.845 | 0.56 | 0.573 |
| 2.271371488545418 | 0.845 | 0.563 | 0.573 |
| 2.274513081199008 | 0.846 | 0.565 | 0.573 |
| 2.277654673852597 | 0.846 | 0.568 | 0.573 |
| 2.280796266506186 | 0.846 | 0.571 | 0.573 |
| 2.283937859159776 | 0.847 | 0.574 | 0.573 |
| 2.287079451813366 | 0.847 | 0.577 | 0.573 |
| 2.290221044466955 | 0.847 | 0.58 | 0.573 |
| 2.293362637120545 | 0.848 | 0.583 | 0.573 |
| 2.296504229774135 | 0.848 | 0.586 | 0.573 |
| 2.299645822427724 | 0.848 | 0.589 | 0.573 |
| 2.302787415081314 | 0.848 | 0.592 | 0.573 |
| 2.305929007734904 | 0.849 | 0.595 | 0.573 |
| 2.309070600388493 | 0.849 | 0.598 | 0.573 |
| 2.312212193042083 | 0.849 | 0.601 | 0.573 |
| 2.315353785695672 | 0.85 | 0.604 | 0.573 |
| 2.318495378349262 | 0.85 | 0.607 | 0.573 |
| 2.321636971002852 | 0.85 | 0.61 | 0.573 |
| 2.324778563656441 | 0.85 | 0.613 | 0.573 |
| 2.327920156310031 | 0.851 | 0.616 | 0.574 |
| 2.33106174896362 | 0.851 | 0.619 | 0.574 |
| 2.33420334161721 | 0.851 | 0.622 | 0.574 |
| 2.3373449342708 | 0.851 | 0.625 | 0.574 |
| 2.340486526924389 | 0.852 | 0.629 | 0.574 |
| 2.343628119577979 | 0.852 | 0.632 | 0.574 |
| 2.346769712231568 | 0.852 | 0.635 | 0.574 |
| 2.349911304885158 | 0.852 | 0.638 | 0.574 |
| 2.353052897538748 | 0.852 | 0.641 | 0.575 |
| 2.356194490192337 | 0.853 | 0.644 | 0.575 |
| 2.359336082845927 | 0.853 | 0.647 | 0.575 |
| 2.362477675499516 | 0.853 | 0.651 | 0.575 |
| 2.365619268153106 | 0.853 | 0.654 | 0.575 |
| 2.368760860806696 | 0.853 | 0.657 | 0.576 |
| 2.371902453460285 | 0.854 | 0.66 | 0.576 |
| 2.375044046113875 | 0.854 | 0.663 | 0.576 |
| 2.378185638767464 | 0.854 | 0.666 | 0.577 |
| 2.381327231421054 | 0.854 | 0.669 | 0.577 |
| 2.384468824074644 | 0.854 | 0.672 | 0.577 |
| 2.387610416728233 | 0.854 | 0.676 | 0.578 |
| 2.390752009381823 | 0.854 | 0.679 | 0.578 |
| 2.393893602035412 | 0.855 | 0.682 | 0.579 |
| 2.397035194689002 | 0.855 | 0.685 | 0.579 |
| 2.400176787342591 | 0.855 | 0.688 | 0.579 |
| 2.403318379996181 | 0.855 | 0.691 | 0.58 |
| 2.406459972649771 | 0.855 | 0.694 | 0.58 |
| 2.40960156530336 | 0.855 | 0.697 | 0.581 |
| 2.41274315795695 | 0.855 | 0.7 | 0.582 |
| 2.41588475061054 | 0.856 | 0.703 | 0.582 |
| 2.419026343264129 | 0.856 | 0.706 | 0.583 |
| 2.422167935917719 | 0.856 | 0.709 | 0.584 |
| 2.425309528571308 | 0.856 | 0.712 | 0.584 |
| 2.428451121224898 | 0.856 | 0.715 | 0.585 |
| 2.431592713878488 | 0.856 | 0.717 | 0.586 |
| 2.434734306532077 | 0.856 | 0.72 | 0.587 |
| 2.437875899185667 | 0.856 | 0.723 | 0.588 |
| 2.441017491839256 | 0.856 | 0.726 | 0.589 |
| 2.444159084492846 | 0.856 | 0.729 | 0.59 |
| 2.447300677146435 | 0.857 | 0.731 | 0.591 |
| 2.450442269800025 | 0.857 | 0.734 | 0.592 |
| 2.453583862453615 | 0.857 | 0.737 | 0.593 |
| 2.456725455107204 | 0.857 | 0.74 | 0.594 |
| 2.459867047760794 | 0.857 | 0.742 | 0.595 |
| 2.463008640414384 | 0.857 | 0.745 | 0.597 |
| 2.466150233067973 | 0.857 | 0.748 | 0.598 |
| 2.469291825721563 | 0.857 | 0.75 | 0.599 |
| 2.472433418375152 | 0.857 | 0.753 | 0.601 |
| 2.475575011028742 | 0.857 | 0.755 | 0.602 |
| 2.478716603682332 | 0.857 | 0.758 | 0.604 |
| 2.481858196335921 | 0.857 | 0.76 | 0.605 |
| 2.48499978898951 | 0.857 | 0.762 | 0.607 |
| 2.4881413816431 | 0.858 | 0.765 | 0.608 |
| 2.49128297429669 | 0.858 | 0.767 | 0.61 |
| 2.49442456695028 | 0.858 | 0.77 | 0.612 |
| 2.497566159603869 | 0.858 | 0.772 | 0.614 |
| 2.500707752257458 | 0.858 | 0.774 | 0.616 |
| 2.503849344911048 | 0.858 | 0.776 | 0.617 |
| 2.506990937564638 | 0.858 | 0.778 | 0.619 |
| 2.510132530218228 | 0.858 | 0.781 | 0.621 |
| 2.513274122871817 | 0.858 | 0.783 | 0.624 |
| 2.516415715525407 | 0.858 | 0.785 | 0.626 |
| 2.519557308178996 | 0.858 | 0.787 | 0.628 |
| 2.522698900832586 | 0.858 | 0.789 | 0.63 |
| 2.525840493486176 | 0.858 | 0.791 | 0.632 |
| 2.528982086139765 | 0.858 | 0.793 | 0.635 |
| 2.532123678793355 | 0.858 | 0.795 | 0.637 |
| 2.535265271446944 | 0.858 | 0.797 | 0.639 |
| 2.538406864100534 | 0.858 | 0.798 | 0.642 |
| 2.541548456754124 | 0.858 | 0.8 | 0.644 |
| 2.544690049407713 | 0.858 | 0.802 | 0.647 |
| 2.547831642061302 | 0.858 | 0.804 | 0.65 |
| 2.550973234714892 | 0.858 | 0.805 | 0.652 |
| 2.554114827368482 | 0.858 | 0.807 | 0.655 |
| 2.557256420022072 | 0.858 | 0.809 | 0.658 |
| 2.560398012675661 | 0.858 | 0.81 | 0.66 |
| 2.563539605329251 | 0.858 | 0.812 | 0.663 |
| 2.56668119798284 | 0.858 | 0.813 | 0.666 |
| 2.56982279063643 | 0.859 | 0.815 | 0.669 |
| 2.57296438329002 | 0.859 | 0.816 | 0.672 |
| 2.576105975943609 | 0.859 | 0.818 | 0.675 |
| 2.579247568597199 | 0.859 | 0.819 | 0.678 |
| 2.582389161250788 | 0.859 | 0.821 | 0.681 |
| 2.585530753904377 | 0.859 | 0.822 | 0.684 |
| 2.588672346557967 | 0.859 | 0.823 | 0.687 |
| 2.591813939211557 | 0.859 | 0.825 | 0.69 |
| 2.594955531865147 | 0.859 | 0.826 | 0.693 |
| 2.598097124518736 | 0.859 | 0.827 | 0.696 |
| 2.601238717172326 | 0.859 | 0.828 | 0.699 |
| 2.604380309825915 | 0.859 | 0.829 | 0.702 |
| 2.607521902479505 | 0.859 | 0.83 | 0.705 |
| 2.610663495133095 | 0.859 | 0.831 | 0.709 |
| 2.613805087786684 | 0.859 | 0.832 | 0.712 |
| 2.616946680440274 | 0.859 | 0.834 | 0.715 |
| 2.620088273093863 | 0.859 | 0.834 | 0.718 |
| 2.623229865747452 | 0.859 | 0.835 | 0.721 |
| 2.626371458401042 | 0.859 | 0.836 | 0.724 |
| 2.629513051054632 | 0.859 | 0.837 | 0.727 |
| 2.632654643708222 | 0.859 | 0.838 | 0.73 |
| 2.635796236361811 | 0.859 | 0.839 | 0.734 |
| 2.638937829015401 | 0.859 | 0.84 | 0.737 |
| 2.642079421668991 | 0.859 | 0.841 | 0.74 |
| 2.64522101432258 | 0.859 | 0.841 | 0.743 |
| 2.64836260697617 | 0.859 | 0.842 | 0.746 |
| 2.651504199629759 | 0.859 | 0.843 | 0.749 |
| 2.654645792283349 | 0.859 | 0.844 | 0.752 |
| 2.657787384936938 | 0.859 | 0.844 | 0.755 |
| 2.660928977590528 | 0.859 | 0.845 | 0.758 |
| 2.664070570244118 | 0.859 | 0.846 | 0.761 |
| 2.667212162897707 | 0.859 | 0.846 | 0.764 |
| 2.670353755551297 | 0.859 | 0.847 | 0.767 |
| 2.673495348204887 | 0.859 | 0.847 | 0.769 |
| 2.676636940858476 | 0.859 | 0.848 | 0.772 |
| 2.679778533512066 | 0.859 | 0.848 | 0.775 |
| 2.682920126165655 | 0.859 | 0.849 | 0.778 |
| 2.686061718819245 | 0.859 | 0.849 | 0.78 |
| 2.689203311472835 | 0.859 | 0.85 | 0.783 |
| 2.692344904126424 | 0.859 | 0.85 | 0.786 |
| 2.695486496780014 | 0.859 | 0.851 | 0.788 |
| 2.698628089433603 | 0.859 | 0.851 | 0.791 |
| 2.701769682087193 | 0.859 | 0.852 | 0.793 |
| 2.704911274740782 | 0.859 | 0.852 | 0.795 |
| 2.708052867394372 | 0.859 | 0.852 | 0.798 |
| 2.711194460047962 | 0.859 | 0.853 | 0.8 |
| 2.714336052701551 | 0.859 | 0.853 | 0.802 |
| 2.717477645355141 | 0.859 | 0.853 | 0.805 |
| 2.720619238008731 | 0.859 | 0.854 | 0.807 |
| 2.72376083066232 | 0.859 | 0.854 | 0.809 |
| 2.72690242331591 | 0.859 | 0.854 | 0.811 |
| 2.730044015969499 | 0.859 | 0.854 | 0.813 |
| 2.733185608623089 | 0.859 | 0.855 | 0.815 |
| 2.736327201276678 | 0.859 | 0.855 | 0.817 |
| 2.739468793930268 | 0.859 | 0.855 | 0.819 |
| 2.742610386583858 | 0.859 | 0.855 | 0.82 |
| 2.745751979237447 | 0.859 | 0.856 | 0.822 |
| 2.748893571891036 | 0.859 | 0.856 | 0.824 |
| 2.752035164544627 | 0.859 | 0.856 | 0.826 |
| 2.755176757198216 | 0.859 | 0.856 | 0.827 |
| 2.758318349851806 | 0.859 | 0.856 | 0.829 |
| 2.761459942505395 | 0.859 | 0.857 | 0.83 |
| 2.764601535158985 | 0.859 | 0.857 | 0.832 |
| 2.767743127812574 | 0.859 | 0.857 | 0.833 |
| 2.770884720466164 | 0.859 | 0.857 | 0.834 |
| 2.774026313119754 | 0.859 | 0.857 | 0.836 |
| 2.777167905773343 | 0.859 | 0.857 | 0.837 |
| 2.780309498426932 | 0.859 | 0.857 | 0.838 |
| 2.783451091080522 | 0.859 | 0.857 | 0.839 |
| 2.786592683734112 | 0.859 | 0.858 | 0.84 |
| 2.789734276387701 | 0.859 | 0.858 | 0.841 |
| 2.792875869041291 | 0.859 | 0.858 | 0.842 |
| 2.796017461694881 | 0.859 | 0.858 | 0.843 |
| 2.79915905434847 | 0.859 | 0.858 | 0.844 |
| 2.80230064700206 | 0.859 | 0.858 | 0.845 |
| 2.80544223965565 | 0.859 | 0.858 | 0.846 |
| 2.808583832309239 | 0.859 | 0.858 | 0.847 |
| 2.811725424962829 | 0.859 | 0.858 | 0.848 |
| 2.814867017616419 | 0.859 | 0.858 | 0.848 |
| 2.818008610270008 | 0.859 | 0.858 | 0.849 |
| 2.821150202923598 | 0.859 | 0.858 | 0.85 |
| 2.824291795577187 | 0.859 | 0.858 | 0.85 |
| 2.827433388230777 | 0.859 | 0.858 | 0.851 |
| 2.830574980884366 | 0.859 | 0.859 | 0.851 |
| 2.833716573537956 | 0.859 | 0.859 | 0.852 |
| 2.836858166191546 | 0.859 | 0.859 | 0.852 |
| 2.839999758845135 | 0.859 | 0.859 | 0.853 |
| 2.843141351498725 | 0.859 | 0.859 | 0.853 |
| 2.846282944152314 | 0.859 | 0.859 | 0.854 |
| 2.849424536805904 | 0.859 | 0.859 | 0.854 |
| 2.852566129459494 | 0.859 | 0.859 | 0.855 |
| 2.855707722113083 | 0.859 | 0.859 | 0.855 |
| 2.858849314766673 | 0.859 | 0.859 | 0.855 |
| 2.861990907420262 | 0.859 | 0.859 | 0.856 |
| 2.865132500073852 | 0.859 | 0.859 | 0.856 |
| 2.868274092727442 | 0.859 | 0.859 | 0.856 |
| 2.871415685381031 | 0.859 | 0.859 | 0.856 |
| 2.874557278034621 | 0.859 | 0.859 | 0.857 |
| 2.87769887068821 | 0.859 | 0.859 | 0.857 |
| 2.8808404633418 | 0.859 | 0.859 | 0.857 |
| 2.88398205599539 | 0.859 | 0.859 | 0.857 |
| 2.88712364864898 | 0.859 | 0.859 | 0.857 |
| 2.890265241302569 | 0.859 | 0.859 | 0.857 |
| 2.893406833956158 | 0.859 | 0.859 | 0.858 |
| 2.896548426609748 | 0.859 | 0.859 | 0.858 |
| 2.899690019263338 | 0.859 | 0.859 | 0.858 |
| 2.902831611916927 | 0.859 | 0.859 | 0.858 |
| 2.905973204570517 | 0.859 | 0.859 | 0.858 |
| 2.909114797224106 | 0.859 | 0.859 | 0.858 |
| 2.912256389877696 | 0.859 | 0.859 | 0.858 |
| 2.915397982531286 | 0.859 | 0.859 | 0.858 |
| 2.918539575184875 | 0.859 | 0.859 | 0.858 |
| 2.921681167838465 | 0.859 | 0.859 | 0.858 |
| 2.924822760492054 | 0.859 | 0.859 | 0.859 |
| 2.927964353145644 | 0.859 | 0.859 | 0.859 |
| 2.931105945799234 | 0.859 | 0.859 | 0.859 |
| 2.934247538452823 | 0.859 | 0.859 | 0.859 |
| 2.937389131106413 | 0.859 | 0.859 | 0.859 |
| 2.940530723760002 | 0.859 | 0.859 | 0.859 |
| 2.943672316413592 | 0.859 | 0.859 | 0.859 |
| 2.946813909067182 | 0.859 | 0.859 | 0.859 |
| 2.949955501720771 | 0.859 | 0.859 | 0.859 |
| 2.953097094374361 | 0.859 | 0.859 | 0.859 |
| 2.95623868702795 | 0.859 | 0.859 | 0.859 |
| 2.95938027968154 | 0.859 | 0.859 | 0.859 |
| 2.96252187233513 | 0.859 | 0.859 | 0.859 |
| 2.965663464988719 | 0.859 | 0.859 | 0.859 |
| 2.968805057642309 | 0.859 | 0.859 | 0.859 |
| 2.971946650295898 | 0.859 | 0.859 | 0.859 |
| 2.975088242949488 | 0.859 | 0.859 | 0.859 |
| 2.978229835603078 | 0.859 | 0.859 | 0.859 |
| 2.981371428256667 | 0.859 | 0.859 | 0.859 |
| 2.984513020910257 | 0.859 | 0.859 | 0.859 |
| 2.987654613563846 | 0.859 | 0.859 | 0.859 |
| 2.990796206217436 | 0.859 | 0.859 | 0.859 |
| 2.993937798871025 | 0.859 | 0.859 | 0.859 |
| 2.997079391524615 | 0.859 | 0.859 | 0.859 |
| 3.000220984178205 | 0.859 | 0.859 | 0.859 |
| 3.003362576831794 | 0.859 | 0.859 | 0.859 |
| 3.006504169485384 | 0.859 | 0.859 | 0.859 |
| 3.009645762138974 | 0.859 | 0.859 | 0.859 |
| 3.012787354792563 | 0.859 | 0.859 | 0.859 |
| 3.015928947446153 | 0.859 | 0.859 | 0.859 |
| 3.019070540099742 | 0.859 | 0.859 | 0.859 |
| 3.022212132753332 | 0.859 | 0.859 | 0.859 |
| 3.025353725406922 | 0.859 | 0.859 | 0.859 |
| 3.028495318060511 | 0.859 | 0.859 | 0.859 |
| 3.031636910714101 | 0.859 | 0.859 | 0.859 |
| 3.03477850336769 | 0.859 | 0.859 | 0.859 |
| 3.03792009602128 | 0.859 | 0.859 | 0.859 |
| 3.04106168867487 | 0.859 | 0.859 | 0.859 |
| 3.04420328132846 | 0.859 | 0.859 | 0.859 |
| 3.047344873982049 | 0.859 | 0.859 | 0.859 |
| 3.050486466635638 | 0.859 | 0.859 | 0.859 |
| 3.053628059289228 | 0.859 | 0.859 | 0.859 |
| 3.056769651942818 | 0.859 | 0.859 | 0.859 |
| 3.059911244596407 | 0.859 | 0.859 | 0.859 |
| 3.063052837249997 | 0.859 | 0.859 | 0.859 |
| 3.066194429903586 | 0.859 | 0.859 | 0.859 |
| 3.069336022557176 | 0.859 | 0.859 | 0.859 |
| 3.072477615210766 | 0.859 | 0.859 | 0.859 |
| 3.075619207864355 | 0.859 | 0.859 | 0.859 |
| 3.078760800517945 | 0.859 | 0.859 | 0.859 |
| 3.081902393171534 | 0.859 | 0.859 | 0.859 |
| 3.085043985825124 | 0.859 | 0.859 | 0.859 |
| 3.088185578478713 | 0.859 | 0.859 | 0.859 |
| 3.091327171132303 | 0.859 | 0.859 | 0.859 |
| 3.094468763785893 | 0.859 | 0.859 | 0.859 |
| 3.097610356439482 | 0.859 | 0.859 | 0.859 |
| 3.100751949093072 | 0.859 | 0.859 | 0.859 |
| 3.103893541746661 | 0.859 | 0.859 | 0.859 |
| 3.107035134400251 | 0.859 | 0.859 | 0.859 |
| 3.110176727053841 | 0.859 | 0.859 | 0.859 |
| 3.11331831970743 | 0.859 | 0.859 | 0.859 |
| 3.11645991236102 | 0.859 | 0.859 | 0.859 |
| 3.11960150501461 | 0.859 | 0.859 | 0.859 |
| 3.122743097668199 | 0.859 | 0.859 | 0.859 |
| 3.125884690321789 | 0.859 | 0.859 | 0.859 |
| 3.129026282975378 | 0.859 | 0.859 | 0.859 |
| 3.132167875628968 | 0.859 | 0.859 | 0.859 |
| 3.135309468282557 | 0.859 | 0.859 | 0.859 |
| 3.138451060936147 | 0.859 | 0.859 | 0.859 |
| 3.141592653589737 | 0.859 | 0.859 | 0.859 |
| 3.144734246243326 | 0.859 | 0.859 | 0.859 |
| 3.147875838896916 | 0.859 | 0.859 | 0.859 |
| 3.151017431550505 | 0.859 | 0.859 | 0.859 |
| 3.154159024204095 | 0.859 | 0.859 | 0.859 |
| 3.157300616857685 | 0.859 | 0.859 | 0.859 |
| 3.160442209511274 | 0.859 | 0.859 | 0.859 |
| 3.163583802164864 | 0.859 | 0.859 | 0.859 |
| 3.166725394818453 | 0.859 | 0.859 | 0.859 |
| 3.169866987472043 | 0.859 | 0.859 | 0.859 |
| 3.173008580125633 | 0.859 | 0.859 | 0.859 |
| 3.176150172779222 | 0.859 | 0.859 | 0.859 |
| 3.179291765432812 | 0.859 | 0.859 | 0.859 |
| 3.182433358086401 | 0.859 | 0.859 | 0.859 |
| 3.185574950739991 | 0.859 | 0.859 | 0.859 |
| 3.188716543393581 | 0.859 | 0.859 | 0.859 |
| 3.19185813604717 | 0.859 | 0.859 | 0.859 |
| 3.19499972870076 | 0.859 | 0.859 | 0.859 |
| 3.198141321354349 | 0.859 | 0.859 | 0.859 |
| 3.20128291400794 | 0.859 | 0.859 | 0.859 |
| 3.204424506661528 | 0.859 | 0.859 | 0.859 |
| 3.207566099315118 | 0.859 | 0.859 | 0.859 |
| 3.210707691968708 | 0.859 | 0.859 | 0.859 |
| 3.213849284622297 | 0.859 | 0.859 | 0.859 |
| 3.216990877275887 | 0.859 | 0.859 | 0.859 |
| 3.220132469929476 | 0.859 | 0.859 | 0.859 |
| 3.223274062583066 | 0.859 | 0.859 | 0.859 |
| 3.226415655236656 | 0.859 | 0.859 | 0.859 |
| 3.229557247890245 | 0.859 | 0.859 | 0.859 |
| 3.232698840543835 | 0.859 | 0.859 | 0.859 |
| 3.235840433197425 | 0.859 | 0.859 | 0.859 |
| 3.238982025851014 | 0.859 | 0.859 | 0.859 |
| 3.242123618504604 | 0.859 | 0.859 | 0.859 |
| 3.245265211158193 | 0.859 | 0.859 | 0.859 |
| 3.248406803811783 | 0.859 | 0.859 | 0.859 |
| 3.251548396465373 | 0.859 | 0.859 | 0.859 |
| 3.254689989118962 | 0.859 | 0.859 | 0.859 |
| 3.257831581772551 | 0.859 | 0.859 | 0.859 |
| 3.260973174426141 | 0.859 | 0.859 | 0.859 |
| 3.26411476707973 | 0.859 | 0.859 | 0.859 |
| 3.267256359733321 | 0.859 | 0.859 | 0.859 |
| 3.27039795238691 | 0.859 | 0.859 | 0.859 |
| 3.2735395450405 | 0.859 | 0.859 | 0.859 |
| 3.276681137694089 | 0.859 | 0.859 | 0.859 |
| 3.279822730347679 | 0.859 | 0.859 | 0.859 |
| 3.282964323001269 | 0.859 | 0.859 | 0.859 |
| 3.286105915654858 | 0.859 | 0.859 | 0.859 |
| 3.289247508308448 | 0.859 | 0.859 | 0.859 |
| 3.292389100962037 | 0.859 | 0.859 | 0.859 |
| 3.295530693615627 | 0.859 | 0.859 | 0.859 |
| 3.298672286269217 | 0.859 | 0.859 | 0.859 |
| 3.301813878922806 | 0.859 | 0.859 | 0.859 |
| 3.304955471576396 | 0.859 | 0.859 | 0.859 |
| 3.308097064229985 | 0.859 | 0.859 | 0.859 |
| 3.311238656883575 | 0.859 | 0.859 | 0.859 |
| 3.314380249537165 | 0.859 | 0.859 | 0.859 |
| 3.317521842190754 | 0.859 | 0.859 | 0.859 |
| 3.320663434844344 | 0.859 | 0.859 | 0.859 |
| 3.323805027497933 | 0.859 | 0.859 | 0.859 |
| 3.326946620151523 | 0.859 | 0.859 | 0.859 |
| 3.330088212805113 | 0.859 | 0.859 | 0.859 |
| 3.333229805458702 | 0.859 | 0.859 | 0.859 |
| 3.336371398112292 | 0.859 | 0.859 | 0.859 |
| 3.339512990765881 | 0.859 | 0.859 | 0.859 |
| 3.342654583419471 | 0.859 | 0.859 | 0.859 |
| 3.345796176073061 | 0.859 | 0.859 | 0.859 |
| 3.34893776872665 | 0.859 | 0.859 | 0.859 |
| 3.35207936138024 | 0.859 | 0.859 | 0.859 |
| 3.355220954033829 | 0.859 | 0.859 | 0.859 |
| 3.358362546687419 | 0.859 | 0.859 | 0.86 |
| 3.361504139341009 | 0.859 | 0.859 | 0.86 |
| 3.364645731994598 | 0.859 | 0.859 | 0.86 |
| 3.367787324648188 | 0.859 | 0.859 | 0.86 |
| 3.370928917301777 | 0.859 | 0.859 | 0.86 |
| 3.374070509955367 | 0.859 | 0.859 | 0.86 |
| 3.377212102608956 | 0.859 | 0.859 | 0.86 |
| 3.380353695262546 | 0.859 | 0.859 | 0.86 |
| 3.383495287916136 | 0.859 | 0.859 | 0.86 |
| 3.386636880569725 | 0.859 | 0.859 | 0.86 |
| 3.389778473223315 | 0.859 | 0.859 | 0.86 |
| 3.392920065876904 | 0.859 | 0.859 | 0.861 |
| 3.396061658530494 | 0.859 | 0.859 | 0.861 |
| 3.399203251184084 | 0.859 | 0.859 | 0.861 |
| 3.402344843837673 | 0.859 | 0.859 | 0.861 |
| 3.405486436491263 | 0.859 | 0.859 | 0.861 |
| 3.408628029144852 | 0.859 | 0.859 | 0.862 |
| 3.411769621798442 | 0.859 | 0.859 | 0.862 |
| 3.414911214452032 | 0.859 | 0.859 | 0.862 |
| 3.418052807105621 | 0.859 | 0.859 | 0.862 |
| 3.421194399759211 | 0.859 | 0.859 | 0.863 |
| 3.4243359924128 | 0.859 | 0.859 | 0.863 |
| 3.42747758506639 | 0.859 | 0.859 | 0.863 |
| 3.43061917771998 | 0.859 | 0.859 | 0.864 |
| 3.433760770373569 | 0.859 | 0.859 | 0.864 |
| 3.436902363027159 | 0.859 | 0.859 | 0.864 |
| 3.440043955680748 | 0.859 | 0.859 | 0.865 |
| 3.443185548334338 | 0.859 | 0.859 | 0.865 |
| 3.446327140987927 | 0.859 | 0.859 | 0.866 |
| 3.449468733641517 | 0.859 | 0.859 | 0.866 |
| 3.452610326295107 | 0.859 | 0.86 | 0.867 |
| 3.455751918948696 | 0.859 | 0.86 | 0.867 |
| 3.458893511602286 | 0.859 | 0.86 | 0.868 |
| 3.462035104255876 | 0.859 | 0.86 | 0.868 |
| 3.465176696909465 | 0.859 | 0.86 | 0.869 |
| 3.468318289563055 | 0.859 | 0.86 | 0.87 |
| 3.471459882216644 | 0.859 | 0.86 | 0.871 |
| 3.474601474870234 | 0.859 | 0.86 | 0.871 |
| 3.477743067523824 | 0.859 | 0.86 | 0.872 |
| 3.480884660177413 | 0.859 | 0.86 | 0.873 |
| 3.484026252831002 | 0.859 | 0.86 | 0.874 |
| 3.487167845484592 | 0.859 | 0.86 | 0.875 |
| 3.490309438138182 | 0.859 | 0.86 | 0.876 |
| 3.493451030791772 | 0.859 | 0.86 | 0.877 |
| 3.496592623445361 | 0.859 | 0.86 | 0.878 |
| 3.499734216098951 | 0.859 | 0.861 | 0.879 |
| 3.50287580875254 | 0.859 | 0.861 | 0.88 |
| 3.50601740140613 | 0.859 | 0.861 | 0.881 |
| 3.50915899405972 | 0.859 | 0.861 | 0.882 |
| 3.512300586713309 | 0.859 | 0.861 | 0.884 |
| 3.515442179366899 | 0.859 | 0.861 | 0.885 |
| 3.518583772020488 | 0.859 | 0.861 | 0.886 |
| 3.521725364674078 | 0.859 | 0.862 | 0.888 |
| 3.524866957327668 | 0.859 | 0.862 | 0.889 |
| 3.528008549981257 | 0.859 | 0.862 | 0.891 |
| 3.531150142634847 | 0.859 | 0.862 | 0.893 |
| 3.534291735288436 | 0.859 | 0.862 | 0.894 |
| 3.537433327942026 | 0.859 | 0.862 | 0.896 |
| 3.540574920595616 | 0.859 | 0.863 | 0.898 |
| 3.543716513249205 | 0.859 | 0.863 | 0.899 |
| 3.546858105902795 | 0.859 | 0.863 | 0.901 |
| 3.549999698556384 | 0.859 | 0.863 | 0.903 |
| 3.553141291209974 | 0.859 | 0.864 | 0.905 |
| 3.556282883863564 | 0.859 | 0.864 | 0.907 |
| 3.559424476517153 | 0.859 | 0.864 | 0.909 |
| 3.562566069170743 | 0.859 | 0.864 | 0.911 |
| 3.565707661824332 | 0.859 | 0.865 | 0.913 |
| 3.568849254477922 | 0.859 | 0.865 | 0.916 |
| 3.571990847131511 | 0.859 | 0.865 | 0.918 |
| 3.575132439785101 | 0.859 | 0.866 | 0.92 |
| 3.578274032438691 | 0.859 | 0.866 | 0.923 |
| 3.58141562509228 | 0.859 | 0.867 | 0.925 |
| 3.58455721774587 | 0.859 | 0.867 | 0.927 |
| 3.58769881039946 | 0.859 | 0.867 | 0.93 |
| 3.590840403053049 | 0.859 | 0.868 | 0.933 |
| 3.593981995706639 | 0.859 | 0.868 | 0.935 |
| 3.597123588360228 | 0.859 | 0.869 | 0.938 |
| 3.600265181013818 | 0.859 | 0.869 | 0.94 |
| 3.603406773667407 | 0.859 | 0.87 | 0.943 |
| 3.606548366320997 | 0.859 | 0.87 | 0.946 |
| 3.609689958974587 | 0.859 | 0.871 | 0.949 |
| 3.612831551628176 | 0.859 | 0.871 | 0.952 |
| 3.615973144281766 | 0.859 | 0.872 | 0.954 |
| 3.619114736935355 | 0.859 | 0.873 | 0.957 |
| 3.622256329588945 | 0.859 | 0.873 | 0.96 |
| 3.625397922242534 | 0.859 | 0.874 | 0.963 |
| 3.628539514896124 | 0.859 | 0.874 | 0.966 |
| 3.631681107549714 | 0.859 | 0.875 | 0.969 |
| 3.634822700203303 | 0.859 | 0.876 | 0.972 |
| 3.637964292856893 | 0.859 | 0.877 | 0.975 |
| 3.641105885510483 | 0.859 | 0.877 | 0.978 |
| 3.644247478164072 | 0.859 | 0.878 | 0.981 |
| 3.647389070817662 | 0.859 | 0.879 | 0.984 |
| 3.650530663471251 | 0.859 | 0.88 | 0.988 |
| 3.653672256124841 | 0.859 | 0.881 | 0.991 |
| 3.656813848778431 | 0.859 | 0.882 | 0.994 |
| 3.65995544143202 | 0.859 | 0.883 | 0.997 |
| 3.66309703408561 | 0.859 | 0.884 | 1 |
| 3.666238626739199 | 0.859 | 0.885 | 1.003 |
| 3.66938021939279 | 0.859 | 0.886 | 1.006 |
| 3.672521812046378 | 0.859 | 0.887 | 1.01 |
| 3.675663404699968 | 0.859 | 0.888 | 1.013 |
| 3.678804997353558 | 0.859 | 0.889 | 1.016 |
| 3.681946590007147 | 0.859 | 0.89 | 1.019 |
| 3.685088182660737 | 0.859 | 0.891 | 1.022 |
| 3.688229775314326 | 0.859 | 0.892 | 1.025 |
| 3.691371367967916 | 0.859 | 0.894 | 1.028 |
| 3.694512960621506 | 0.859 | 0.895 | 1.031 |
| 3.697654553275095 | 0.859 | 0.896 | 1.034 |
| 3.700796145928685 | 0.859 | 0.897 | 1.037 |
| 3.703937738582274 | 0.859 | 0.899 | 1.04 |
| 3.707079331235864 | 0.859 | 0.9 | 1.043 |
| 3.710220923889454 | 0.86 | 0.902 | 1.046 |
| 3.713362516543043 | 0.86 | 0.903 | 1.049 |
| 3.716504109196633 | 0.86 | 0.905 | 1.052 |
| 3.719645701850223 | 0.86 | 0.906 | 1.055 |
| 3.722787294503812 | 0.86 | 0.908 | 1.058 |
| 3.725928887157402 | 0.86 | 0.909 | 1.06 |
| 3.729070479810991 | 0.86 | 0.911 | 1.063 |
| 3.732212072464581 | 0.86 | 0.913 | 1.066 |
| 3.735353665118171 | 0.86 | 0.914 | 1.068 |
| 3.73849525777176 | 0.86 | 0.916 | 1.071 |
| 3.74163685042535 | 0.86 | 0.918 | 1.074 |
| 3.744778443078939 | 0.86 | 0.92 | 1.076 |
| 3.747920035732529 | 0.86 | 0.921 | 1.079 |
| 3.751061628386119 | 0.86 | 0.923 | 1.081 |
| 3.754203221039708 | 0.86 | 0.925 | 1.083 |
| 3.757344813693298 | 0.86 | 0.927 | 1.086 |
| 3.760486406346887 | 0.86 | 0.929 | 1.088 |
| 3.763627999000477 | 0.86 | 0.931 | 1.09 |
| 3.766769591654067 | 0.86 | 0.933 | 1.092 |
| 3.769911184307656 | 0.86 | 0.935 | 1.095 |
| 3.773052776961246 | 0.86 | 0.937 | 1.097 |
| 3.776194369614835 | 0.86 | 0.94 | 1.099 |
| 3.779335962268425 | 0.86 | 0.942 | 1.101 |
| 3.782477554922014 | 0.86 | 0.944 | 1.103 |
| 3.785619147575604 | 0.86 | 0.946 | 1.104 |
| 3.788760740229193 | 0.86 | 0.949 | 1.106 |
| 3.791902332882783 | 0.86 | 0.951 | 1.108 |
| 3.795043925536373 | 0.861 | 0.953 | 1.11 |
| 3.798185518189962 | 0.861 | 0.956 | 1.111 |
| 3.801327110843552 | 0.861 | 0.958 | 1.113 |
| 3.804468703497142 | 0.861 | 0.96 | 1.115 |
| 3.807610296150731 | 0.861 | 0.963 | 1.116 |
| 3.810751888804321 | 0.861 | 0.965 | 1.117 |
| 3.813893481457911 | 0.861 | 0.968 | 1.119 |
| 3.8170350741115 | 0.861 | 0.971 | 1.12 |
| 3.82017666676509 | 0.861 | 0.973 | 1.122 |
| 3.823318259418679 | 0.861 | 0.976 | 1.123 |
| 3.826459852072269 | 0.861 | 0.978 | 1.124 |
| 3.829601444725859 | 0.861 | 0.981 | 1.125 |
| 3.832743037379448 | 0.861 | 0.984 | 1.126 |
| 3.835884630033038 | 0.861 | 0.987 | 1.127 |
| 3.839026222686627 | 0.862 | 0.989 | 1.128 |
| 3.842167815340217 | 0.862 | 0.992 | 1.129 |
| 3.845309407993807 | 0.862 | 0.995 | 1.13 |
| 3.848451000647396 | 0.862 | 0.998 | 1.131 |
| 3.851592593300986 | 0.862 | 1.001 | 1.132 |
| 3.854734185954575 | 0.862 | 1.003 | 1.133 |
| 3.857875778608165 | 0.862 | 1.006 | 1.134 |
| 3.861017371261755 | 0.862 | 1.009 | 1.134 |
| 3.864158963915344 | 0.862 | 1.012 | 1.135 |
| 3.867300556568933 | 0.863 | 1.015 | 1.136 |
| 3.870442149222523 | 0.863 | 1.018 | 1.136 |
| 3.873583741876112 | 0.863 | 1.021 | 1.137 |
| 3.876725334529703 | 0.863 | 1.024 | 1.138 |
| 3.879866927183292 | 0.863 | 1.027 | 1.138 |
| 3.883008519836882 | 0.863 | 1.03 | 1.139 |
| 3.886150112490471 | 0.863 | 1.033 | 1.139 |
| 3.889291705144061 | 0.863 | 1.036 | 1.14 |
| 3.892433297797651 | 0.864 | 1.039 | 1.14 |
| 3.89557489045124 | 0.864 | 1.043 | 1.14 |
| 3.89871648310483 | 0.864 | 1.046 | 1.141 |
| 3.901858075758419 | 0.864 | 1.049 | 1.141 |
| 3.904999668412009 | 0.864 | 1.052 | 1.141 |
| 3.908141261065598 | 0.864 | 1.055 | 1.142 |
| 3.911282853719188 | 0.865 | 1.058 | 1.142 |
| 3.914424446372778 | 0.865 | 1.061 | 1.142 |
| 3.917566039026367 | 0.865 | 1.064 | 1.143 |
| 3.920707631679957 | 0.865 | 1.068 | 1.143 |
| 3.923849224333547 | 0.865 | 1.071 | 1.143 |
| 3.926990816987136 | 0.865 | 1.074 | 1.143 |
| 3.930132409640726 | 0.866 | 1.077 | 1.143 |
| 3.933274002294315 | 0.866 | 1.08 | 1.144 |
| 3.936415594947905 | 0.866 | 1.083 | 1.144 |
| 3.939557187601495 | 0.866 | 1.086 | 1.144 |
| 3.942698780255084 | 0.866 | 1.089 | 1.144 |
| 3.945840372908674 | 0.867 | 1.093 | 1.144 |
| 3.948981965562263 | 0.867 | 1.096 | 1.144 |
| 3.952123558215853 | 0.867 | 1.099 | 1.144 |
| 3.955265150869442 | 0.867 | 1.102 | 1.144 |
| 3.958406743523032 | 0.868 | 1.105 | 1.145 |
| 3.961548336176622 | 0.868 | 1.108 | 1.145 |
| 3.964689928830211 | 0.868 | 1.111 | 1.145 |
| 3.967831521483801 | 0.868 | 1.114 | 1.145 |
| 3.97097311413739 | 0.869 | 1.117 | 1.145 |
| 3.97411470679098 | 0.869 | 1.12 | 1.145 |
| 3.97725629944457 | 0.869 | 1.123 | 1.145 |
| 3.98039789209816 | 0.87 | 1.126 | 1.145 |
| 3.983539484751749 | 0.87 | 1.129 | 1.145 |
| 3.986681077405338 | 0.87 | 1.132 | 1.145 |
| 3.989822670058928 | 0.87 | 1.135 | 1.145 |
| 3.992964262712517 | 0.871 | 1.138 | 1.145 |
| 3.996105855366107 | 0.871 | 1.141 | 1.145 |
| 3.999247448019697 | 0.871 | 1.144 | 1.145 |
| 4.002389040673287 | 0.872 | 1.147 | 1.145 |
| 4.005530633326877 | 0.872 | 1.15 | 1.145 |
| 4.008672225980466 | 0.873 | 1.153 | 1.145 |
| 4.011813818634056 | 0.873 | 1.155 | 1.145 |
| 4.014955411287645 | 0.873 | 1.158 | 1.145 |
| 4.018097003941234 | 0.874 | 1.161 | 1.145 |
| 4.021238596594824 | 0.874 | 1.164 | 1.145 |
| 4.024380189248414 | 0.874 | 1.166 | 1.145 |
| 4.027521781902004 | 0.875 | 1.169 | 1.145 |
| 4.030663374555593 | 0.875 | 1.172 | 1.145 |
| 4.033804967209183 | 0.876 | 1.174 | 1.145 |
| 4.036946559862773 | 0.876 | 1.177 | 1.145 |
| 4.040088152516362 | 0.877 | 1.18 | 1.145 |
| 4.043229745169951 | 0.877 | 1.182 | 1.145 |
| 4.046371337823541 | 0.877 | 1.185 | 1.145 |
| 4.049512930477131 | 0.878 | 1.187 | 1.145 |
| 4.05265452313072 | 0.878 | 1.19 | 1.145 |
| 4.05579611578431 | 0.879 | 1.192 | 1.145 |
| 4.0589377084379 | 0.879 | 1.194 | 1.145 |
| 4.062079301091489 | 0.88 | 1.197 | 1.145 |
| 4.065220893745079 | 0.88 | 1.199 | 1.145 |
| 4.068362486398668 | 0.881 | 1.201 | 1.145 |
| 4.071504079052258 | 0.881 | 1.204 | 1.145 |
| 4.074645671705848 | 0.882 | 1.206 | 1.145 |
| 4.077787264359437 | 0.882 | 1.208 | 1.145 |
| 4.080928857013027 | 0.883 | 1.21 | 1.145 |
| 4.084070449666616 | 0.884 | 1.212 | 1.145 |
| 4.087212042320206 | 0.884 | 1.214 | 1.145 |
| 4.090353634973795 | 0.885 | 1.216 | 1.145 |
| 4.093495227627385 | 0.885 | 1.218 | 1.145 |
| 4.096636820280975 | 0.886 | 1.22 | 1.145 |
| 4.099778412934564 | 0.887 | 1.222 | 1.145 |
| 4.102920005588154 | 0.887 | 1.224 | 1.145 |
| 4.106061598241744 | 0.888 | 1.226 | 1.145 |
| 4.109203190895333 | 0.889 | 1.228 | 1.145 |
| 4.112344783548923 | 0.889 | 1.23 | 1.145 |
| 4.115486376202512 | 0.89 | 1.232 | 1.145 |
| 4.118627968856102 | 0.891 | 1.233 | 1.145 |
| 4.121769561509692 | 0.891 | 1.235 | 1.145 |
| 4.124911154163281 | 0.892 | 1.237 | 1.145 |
| 4.128052746816871 | 0.893 | 1.238 | 1.145 |
| 4.13119433947046 | 0.894 | 1.24 | 1.145 |
| 4.13433593212405 | 0.894 | 1.241 | 1.145 |
| 4.13747752477764 | 0.895 | 1.243 | 1.145 |
| 4.14061911743123 | 0.896 | 1.244 | 1.145 |
| 4.143760710084818 | 0.897 | 1.246 | 1.145 |
| 4.146902302738408 | 0.897 | 1.247 | 1.145 |
| 4.150043895391998 | 0.898 | 1.249 | 1.145 |
| 4.153185488045588 | 0.899 | 1.25 | 1.145 |
| 4.156327080699177 | 0.9 | 1.251 | 1.145 |
| 4.159468673352766 | 0.901 | 1.253 | 1.145 |
| 4.162610266006356 | 0.902 | 1.254 | 1.145 |
| 4.165751858659946 | 0.903 | 1.255 | 1.145 |
| 4.168893451313535 | 0.903 | 1.256 | 1.145 |
| 4.172035043967125 | 0.904 | 1.258 | 1.145 |
| 4.175176636620715 | 0.905 | 1.259 | 1.145 |
| 4.178318229274304 | 0.906 | 1.26 | 1.145 |
| 4.181459821927894 | 0.907 | 1.261 | 1.145 |
| 4.184601414581484 | 0.908 | 1.262 | 1.145 |
| 4.187743007235073 | 0.909 | 1.263 | 1.145 |
| 4.190884599888663 | 0.91 | 1.264 | 1.145 |
| 4.194026192542252 | 0.911 | 1.265 | 1.145 |
| 4.197167785195842 | 0.912 | 1.266 | 1.145 |
| 4.200309377849432 | 0.913 | 1.267 | 1.145 |
| 4.203450970503021 | 0.914 | 1.268 | 1.145 |
| 4.206592563156611 | 0.915 | 1.269 | 1.145 |
| 4.2097341558102 | 0.916 | 1.269 | 1.145 |
| 4.21287574846379 | 0.917 | 1.27 | 1.145 |
| 4.21601734111738 | 0.919 | 1.271 | 1.145 |
| 4.21915893377097 | 0.92 | 1.272 | 1.145 |
| 4.222300526424559 | 0.921 | 1.272 | 1.145 |
| 4.225442119078148 | 0.922 | 1.273 | 1.145 |
| 4.228583711731738 | 0.923 | 1.274 | 1.145 |
| 4.231725304385327 | 0.924 | 1.274 | 1.145 |
| 4.234866897038917 | 0.926 | 1.275 | 1.145 |
| 4.238008489692506 | 0.927 | 1.276 | 1.145 |
| 4.241150082346096 | 0.928 | 1.276 | 1.145 |
| 4.244291674999685 | 0.929 | 1.277 | 1.145 |
| 4.247433267653276 | 0.931 | 1.277 | 1.145 |
| 4.250574860306865 | 0.932 | 1.278 | 1.145 |
| 4.253716452960455 | 0.933 | 1.278 | 1.145 |
| 4.256858045614044 | 0.935 | 1.279 | 1.145 |
| 4.259999638267634 | 0.936 | 1.279 | 1.145 |
| 4.263141230921224 | 0.937 | 1.28 | 1.145 |
| 4.266282823574813 | 0.939 | 1.28 | 1.145 |
| 4.269424416228403 | 0.94 | 1.281 | 1.145 |
| 4.272566008881992 | 0.941 | 1.281 | 1.145 |
| 4.275707601535582 | 0.943 | 1.281 | 1.145 |
| 4.27884919418917 | 0.944 | 1.282 | 1.145 |
| 4.28199078684276 | 0.946 | 1.282 | 1.145 |
| 4.285132379496351 | 0.947 | 1.282 | 1.145 |
| 4.28827397214994 | 0.949 | 1.283 | 1.145 |
| 4.29141556480353 | 0.95 | 1.283 | 1.145 |
| 4.294557157457119 | 0.952 | 1.283 | 1.145 |
| 4.29769875011071 | 0.953 | 1.284 | 1.145 |
| 4.300840342764299 | 0.955 | 1.284 | 1.145 |
| 4.303981935417888 | 0.956 | 1.284 | 1.145 |
| 4.307123528071478 | 0.958 | 1.284 | 1.145 |
| 4.310265120725067 | 0.96 | 1.285 | 1.145 |
| 4.313406713378657 | 0.961 | 1.285 | 1.145 |
| 4.316548306032247 | 0.963 | 1.285 | 1.145 |
| 4.319689898685836 | 0.964 | 1.285 | 1.145 |
| 4.322831491339426 | 0.966 | 1.286 | 1.145 |
| 4.325973083993015 | 0.968 | 1.286 | 1.145 |
| 4.329114676646605 | 0.97 | 1.286 | 1.145 |
| 4.332256269300195 | 0.971 | 1.286 | 1.145 |
| 4.335397861953784 | 0.973 | 1.286 | 1.145 |
| 4.338539454607374 | 0.975 | 1.286 | 1.145 |
| 4.341681047260963 | 0.977 | 1.286 | 1.145 |
| 4.344822639914553 | 0.978 | 1.287 | 1.145 |
| 4.347964232568143 | 0.98 | 1.287 | 1.145 |
| 4.351105825221732 | 0.982 | 1.287 | 1.145 |
| 4.354247417875322 | 0.984 | 1.287 | 1.145 |
| 4.357389010528911 | 0.986 | 1.287 | 1.145 |
| 4.360530603182501 | 0.988 | 1.287 | 1.145 |
| 4.36367219583609 | 0.989 | 1.287 | 1.145 |
| 4.36681378848968 | 0.991 | 1.287 | 1.145 |
| 4.36995538114327 | 0.993 | 1.287 | 1.145 |
| 4.373096973796859 | 0.995 | 1.288 | 1.146 |
| 4.376238566450449 | 0.997 | 1.288 | 1.146 |
| 4.379380159104038 | 0.999 | 1.288 | 1.146 |
| 4.382521751757628 | 1.001 | 1.288 | 1.146 |
| 4.385663344411217 | 1.003 | 1.288 | 1.146 |
| 4.388804937064807 | 1.005 | 1.288 | 1.146 |
| 4.391946529718397 | 1.007 | 1.288 | 1.146 |
| 4.395088122371987 | 1.009 | 1.288 | 1.146 |
| 4.398229715025576 | 1.012 | 1.288 | 1.146 |
| 4.401371307679165 | 1.014 | 1.288 | 1.146 |
| 4.404512900332755 | 1.016 | 1.288 | 1.146 |
| 4.407654492986345 | 1.018 | 1.288 | 1.146 |
| 4.410796085639934 | 1.02 | 1.288 | 1.146 |
| 4.413937678293524 | 1.022 | 1.288 | 1.146 |
| 4.417079270947114 | 1.024 | 1.288 | 1.146 |
| 4.420220863600703 | 1.027 | 1.288 | 1.146 |
| 4.423362456254293 | 1.029 | 1.288 | 1.146 |
| 4.426504048907883 | 1.031 | 1.288 | 1.146 |
| 4.429645641561472 | 1.033 | 1.288 | 1.146 |
| 4.432787234215062 | 1.036 | 1.288 | 1.147 |
| 4.435928826868651 | 1.038 | 1.288 | 1.147 |
| 4.43907041952224 | 1.04 | 1.288 | 1.147 |
| 4.44221201217583 | 1.043 | 1.288 | 1.147 |
| 4.44535360482942 | 1.045 | 1.288 | 1.147 |
| 4.44849519748301 | 1.047 | 1.288 | 1.147 |
| 4.4516367901366 | 1.05 | 1.288 | 1.148 |
| 4.454778382790188 | 1.052 | 1.288 | 1.148 |
| 4.457919975443779 | 1.055 | 1.288 | 1.148 |
| 4.461061568097368 | 1.057 | 1.288 | 1.148 |
| 4.464203160750958 | 1.059 | 1.288 | 1.149 |
| 4.467344753404547 | 1.062 | 1.288 | 1.149 |
| 4.470486346058137 | 1.064 | 1.288 | 1.149 |
| 4.473627938711726 | 1.067 | 1.288 | 1.149 |
| 4.476769531365316 | 1.069 | 1.288 | 1.15 |
| 4.479911124018905 | 1.072 | 1.288 | 1.15 |
| 4.483052716672495 | 1.074 | 1.289 | 1.15 |
| 4.486194309326085 | 1.077 | 1.289 | 1.151 |
| 4.489335901979674 | 1.08 | 1.289 | 1.151 |
| 4.492477494633264 | 1.082 | 1.289 | 1.152 |
| 4.495619087286854 | 1.085 | 1.289 | 1.152 |
| 4.498760679940443 | 1.087 | 1.289 | 1.153 |
| 4.501902272594033 | 1.09 | 1.289 | 1.153 |
| 4.505043865247622 | 1.093 | 1.289 | 1.154 |
| 4.508185457901212 | 1.095 | 1.289 | 1.155 |
| 4.511327050554801 | 1.098 | 1.289 | 1.155 |
| 4.514468643208391 | 1.101 | 1.289 | 1.156 |
| 4.517610235861981 | 1.103 | 1.289 | 1.157 |
| 4.520751828515571 | 1.106 | 1.289 | 1.157 |
| 4.52389342116916 | 1.109 | 1.289 | 1.158 |
| 4.52703501382275 | 1.111 | 1.289 | 1.159 |
| 4.530176606476339 | 1.114 | 1.289 | 1.16 |
| 4.533318199129928 | 1.117 | 1.289 | 1.161 |
| 4.536459791783518 | 1.12 | 1.289 | 1.162 |
| 4.539601384437108 | 1.122 | 1.289 | 1.163 |
| 4.542742977090698 | 1.125 | 1.289 | 1.164 |
| 4.545884569744287 | 1.128 | 1.289 | 1.165 |
| 4.549026162397876 | 1.131 | 1.289 | 1.166 |
| 4.552167755051466 | 1.134 | 1.289 | 1.167 |
| 4.555309347705056 | 1.136 | 1.289 | 1.168 |
| 4.558450940358646 | 1.139 | 1.289 | 1.17 |
| 4.561592533012235 | 1.142 | 1.289 | 1.171 |
| 4.564734125665825 | 1.145 | 1.289 | 1.172 |
| 4.567875718319415 | 1.148 | 1.289 | 1.174 |
| 4.571017310973004 | 1.151 | 1.289 | 1.175 |
| 4.574158903626594 | 1.154 | 1.289 | 1.177 |
| 4.577300496280183 | 1.157 | 1.289 | 1.178 |
| 4.580442088933772 | 1.16 | 1.289 | 1.18 |
| 4.583583681587362 | 1.163 | 1.289 | 1.182 |
| 4.586725274240952 | 1.165 | 1.289 | 1.183 |
| 4.589866866894542 | 1.168 | 1.289 | 1.185 |
| 4.593008459548131 | 1.171 | 1.289 | 1.187 |
| 4.596150052201721 | 1.174 | 1.289 | 1.189 |
| 4.59929164485531 | 1.177 | 1.289 | 1.191 |
| 4.6024332375089 | 1.18 | 1.289 | 1.193 |
| 4.60557483016249 | 1.183 | 1.289 | 1.195 |
| 4.608716422816079 | 1.186 | 1.289 | 1.197 |
| 4.611858015469668 | 1.189 | 1.289 | 1.199 |
| 4.614999608123258 | 1.192 | 1.289 | 1.201 |
| 4.618141200776848 | 1.195 | 1.289 | 1.204 |
| 4.621282793430437 | 1.198 | 1.289 | 1.206 |
| 4.624424386084027 | 1.201 | 1.289 | 1.208 |
| 4.627565978737617 | 1.205 | 1.289 | 1.211 |
| 4.630707571391206 | 1.208 | 1.289 | 1.213 |
| 4.633849164044795 | 1.211 | 1.289 | 1.215 |
| 4.636990756698386 | 1.214 | 1.289 | 1.218 |
| 4.640132349351975 | 1.217 | 1.289 | 1.221 |
| 4.643273942005564 | 1.22 | 1.289 | 1.223 |
| 4.646415534659154 | 1.223 | 1.289 | 1.226 |
| 4.649557127312744 | 1.226 | 1.289 | 1.229 |
| 4.652698719966334 | 1.229 | 1.289 | 1.231 |
| 4.655840312619923 | 1.232 | 1.289 | 1.234 |
| 4.658981905273513 | 1.235 | 1.289 | 1.237 |
| 4.662123497927102 | 1.238 | 1.289 | 1.24 |
| 4.665265090580692 | 1.242 | 1.289 | 1.243 |
| 4.668406683234282 | 1.245 | 1.289 | 1.246 |
| 4.671548275887871 | 1.248 | 1.289 | 1.249 |
| 4.674689868541461 | 1.251 | 1.289 | 1.251 |
| 4.67783146119505 | 1.254 | 1.289 | 1.254 |
| 4.68097305384864 | 1.257 | 1.289 | 1.257 |
| 4.68411464650223 | 1.26 | 1.289 | 1.261 |
| 4.687256239155819 | 1.263 | 1.289 | 1.264 |
| 4.690397831809409 | 1.267 | 1.289 | 1.267 |
| 4.693539424462998 | 1.27 | 1.289 | 1.27 |
| 4.696681017116588 | 1.273 | 1.289 | 1.273 |
| 4.699822609770177 | 1.276 | 1.289 | 1.276 |
| 4.702964202423767 | 1.279 | 1.289 | 1.279 |
| 4.706105795077356 | 1.282 | 1.289 | 1.282 |
| 4.709247387730946 | 1.285 | 1.289 | 1.285 |
| 4.712388980384535 | 1.289 | 1.289 | 1.289 |
| 4.715530573038126 | 1.292 | 1.289 | 1.292 |
| 4.718672165691715 | 1.295 | 1.289 | 1.295 |
| 4.721813758345305 | 1.298 | 1.289 | 1.298 |
| 4.724955350998894 | 1.301 | 1.289 | 1.301 |
| 4.728096943652484 | 1.304 | 1.289 | 1.304 |
| 4.731238536306074 | 1.307 | 1.289 | 1.307 |
| 4.734380128959663 | 1.311 | 1.289 | 1.31 |
| 4.737521721613253 | 1.314 | 1.289 | 1.313 |
| 4.740663314266842 | 1.317 | 1.289 | 1.317 |
| 4.743804906920432 | 1.32 | 1.289 | 1.32 |
| 4.74694649957402 | 1.323 | 1.289 | 1.323 |
| 4.750088092227611 | 1.326 | 1.289 | 1.326 |
| 4.7532296848812 | 1.329 | 1.289 | 1.329 |
| 4.75637127753479 | 1.332 | 1.289 | 1.332 |
| 4.75951287018838 | 1.336 | 1.289 | 1.334 |
| 4.76265446284197 | 1.339 | 1.289 | 1.337 |
| 4.765796055495559 | 1.342 | 1.289 | 1.34 |
| 4.768937648149149 | 1.345 | 1.289 | 1.343 |
| 4.772079240802738 | 1.348 | 1.289 | 1.346 |
| 4.775220833456327 | 1.351 | 1.289 | 1.349 |
| 4.778362426109917 | 1.354 | 1.289 | 1.351 |
| 4.781504018763507 | 1.357 | 1.289 | 1.354 |
| 4.784645611417097 | 1.36 | 1.289 | 1.356 |
| 4.787787204070686 | 1.363 | 1.289 | 1.359 |
| 4.790928796724275 | 1.366 | 1.289 | 1.362 |
| 4.794070389377865 | 1.37 | 1.289 | 1.364 |
| 4.797211982031455 | 1.373 | 1.289 | 1.367 |
| 4.800353574685045 | 1.376 | 1.289 | 1.369 |
| 4.803495167338634 | 1.379 | 1.289 | 1.371 |
| 4.806636759992224 | 1.382 | 1.289 | 1.374 |
| 4.809778352645814 | 1.385 | 1.289 | 1.376 |
| 4.812919945299403 | 1.388 | 1.289 | 1.378 |
| 4.816061537952993 | 1.391 | 1.289 | 1.38 |
| 4.819203130606582 | 1.394 | 1.289 | 1.382 |
| 4.822344723260172 | 1.397 | 1.289 | 1.384 |
| 4.825486315913761 | 1.4 | 1.289 | 1.386 |
| 4.828627908567351 | 1.403 | 1.289 | 1.388 |
| 4.83176950122094 | 1.406 | 1.289 | 1.39 |
| 4.83491109387453 | 1.409 | 1.289 | 1.392 |
| 4.83805268652812 | 1.412 | 1.289 | 1.394 |
| 4.841194279181709 | 1.415 | 1.289 | 1.395 |
| 4.844335871835299 | 1.417 | 1.289 | 1.397 |
| 4.847477464488889 | 1.42 | 1.289 | 1.399 |
| 4.850619057142478 | 1.423 | 1.289 | 1.4 |
| 4.853760649796068 | 1.426 | 1.289 | 1.402 |
| 4.856902242449657 | 1.429 | 1.289 | 1.403 |
| 4.860043835103247 | 1.432 | 1.289 | 1.405 |
| 4.863185427756837 | 1.435 | 1.289 | 1.406 |
| 4.866327020410426 | 1.438 | 1.289 | 1.407 |
| 4.869468613064015 | 1.441 | 1.289 | 1.409 |
| 4.872610205717605 | 1.443 | 1.289 | 1.41 |
| 4.875751798371195 | 1.446 | 1.289 | 1.411 |
| 4.878893391024784 | 1.449 | 1.289 | 1.412 |
| 4.882034983678374 | 1.452 | 1.289 | 1.413 |
| 4.885176576331964 | 1.455 | 1.289 | 1.414 |
| 4.888318168985553 | 1.457 | 1.289 | 1.415 |
| 4.891459761639143 | 1.46 | 1.289 | 1.416 |
| 4.894601354292733 | 1.463 | 1.289 | 1.417 |
| 4.897742946946322 | 1.466 | 1.289 | 1.418 |
| 4.900884539599912 | 1.468 | 1.289 | 1.419 |
| 4.904026132253501 | 1.471 | 1.289 | 1.42 |
| 4.907167724907091 | 1.474 | 1.289 | 1.42 |
| 4.91030931756068 | 1.477 | 1.289 | 1.421 |
| 4.91345091021427 | 1.479 | 1.289 | 1.422 |
| 4.91659250286786 | 1.482 | 1.289 | 1.423 |
| 4.91973409552145 | 1.485 | 1.289 | 1.423 |
| 4.922875688175039 | 1.487 | 1.289 | 1.424 |
| 4.926017280828628 | 1.49 | 1.289 | 1.424 |
| 4.929158873482218 | 1.492 | 1.289 | 1.425 |
| 4.932300466135808 | 1.495 | 1.289 | 1.425 |
| 4.935442058789397 | 1.498 | 1.289 | 1.426 |
| 4.938583651442987 | 1.5 | 1.289 | 1.426 |
| 4.941725244096576 | 1.503 | 1.289 | 1.427 |
| 4.944866836750166 | 1.505 | 1.289 | 1.427 |
| 4.948008429403755 | 1.508 | 1.289 | 1.427 |
| 4.951150022057345 | 1.51 | 1.289 | 1.428 |
| 4.954291614710935 | 1.513 | 1.289 | 1.428 |
| 4.957433207364524 | 1.515 | 1.289 | 1.428 |
| 4.960574800018114 | 1.518 | 1.289 | 1.429 |
| 4.963716392671704 | 1.52 | 1.289 | 1.429 |
| 4.966857985325293 | 1.523 | 1.289 | 1.429 |
| 4.969999577978883 | 1.525 | 1.289 | 1.429 |
| 4.973141170632472 | 1.527 | 1.289 | 1.43 |
| 4.976282763286062 | 1.53 | 1.289 | 1.43 |
| 4.979424355939651 | 1.532 | 1.289 | 1.43 |
| 4.982565948593241 | 1.534 | 1.289 | 1.43 |
| 4.985707541246831 | 1.537 | 1.289 | 1.43 |
| 4.98884913390042 | 1.539 | 1.289 | 1.43 |
| 4.99199072655401 | 1.541 | 1.289 | 1.43 |
| 4.9951323192076 | 1.544 | 1.289 | 1.431 |
| 4.99827391186119 | 1.546 | 1.289 | 1.431 |
| 5.00141550451478 | 1.548 | 1.289 | 1.431 |
| 5.004557097168369 | 1.55 | 1.289 | 1.431 |
| 5.007698689821958 | 1.553 | 1.289 | 1.431 |
| 5.010840282475548 | 1.555 | 1.289 | 1.431 |
| 5.013981875129137 | 1.557 | 1.289 | 1.431 |
| 5.017123467782727 | 1.559 | 1.289 | 1.431 |
| 5.020265060436317 | 1.561 | 1.289 | 1.431 |
| 5.023406653089906 | 1.563 | 1.289 | 1.431 |
| 5.026548245743496 | 1.566 | 1.289 | 1.431 |
| 5.029689838397085 | 1.568 | 1.289 | 1.431 |
| 5.032831431050674 | 1.57 | 1.289 | 1.431 |
| 5.035973023704264 | 1.572 | 1.289 | 1.431 |
| 5.039114616357854 | 1.574 | 1.289 | 1.431 |
| 5.042256209011444 | 1.576 | 1.289 | 1.432 |
| 5.045397801665033 | 1.578 | 1.289 | 1.432 |
| 5.048539394318622 | 1.58 | 1.289 | 1.432 |
| 5.051680986972213 | 1.582 | 1.29 | 1.432 |
| 5.054822579625802 | 1.584 | 1.29 | 1.432 |
| 5.057964172279392 | 1.586 | 1.29 | 1.432 |
| 5.061105764932981 | 1.588 | 1.29 | 1.432 |
| 5.064247357586571 | 1.59 | 1.29 | 1.432 |
| 5.067388950240161 | 1.591 | 1.29 | 1.432 |
| 5.07053054289375 | 1.593 | 1.29 | 1.432 |
| 5.07367213554734 | 1.595 | 1.29 | 1.432 |
| 5.07681372820093 | 1.597 | 1.29 | 1.432 |
| 5.079955320854519 | 1.599 | 1.29 | 1.432 |
| 5.083096913508108 | 1.601 | 1.291 | 1.432 |
| 5.086238506161698 | 1.602 | 1.291 | 1.432 |
| 5.089380098815288 | 1.604 | 1.291 | 1.432 |
| 5.092521691468877 | 1.606 | 1.291 | 1.432 |
| 5.095663284122466 | 1.608 | 1.291 | 1.432 |
| 5.098804876776057 | 1.609 | 1.291 | 1.432 |
| 5.101946469429646 | 1.611 | 1.292 | 1.432 |
| 5.105088062083236 | 1.613 | 1.292 | 1.432 |
| 5.108229654736825 | 1.614 | 1.292 | 1.432 |
| 5.111371247390415 | 1.616 | 1.292 | 1.432 |
| 5.114512840044005 | 1.618 | 1.292 | 1.432 |
| 5.117654432697594 | 1.619 | 1.293 | 1.432 |
| 5.120796025351184 | 1.621 | 1.293 | 1.432 |
| 5.123937618004773 | 1.622 | 1.293 | 1.432 |
| 5.127079210658363 | 1.624 | 1.293 | 1.432 |
| 5.130220803311953 | 1.625 | 1.294 | 1.432 |
| 5.133362395965542 | 1.627 | 1.294 | 1.432 |
| 5.136503988619131 | 1.628 | 1.294 | 1.432 |
| 5.13964558127272 | 1.63 | 1.295 | 1.432 |
| 5.142787173926311 | 1.631 | 1.295 | 1.432 |
| 5.1459287665799 | 1.633 | 1.295 | 1.432 |
| 5.14907035923349 | 1.634 | 1.296 | 1.432 |
| 5.15221195188708 | 1.636 | 1.296 | 1.432 |
| 5.15535354454067 | 1.637 | 1.296 | 1.432 |
| 5.158495137194259 | 1.639 | 1.297 | 1.432 |
| 5.161636729847848 | 1.64 | 1.297 | 1.432 |
| 5.164778322501438 | 1.641 | 1.298 | 1.432 |
| 5.167919915155028 | 1.643 | 1.298 | 1.432 |
| 5.171061507808617 | 1.644 | 1.299 | 1.432 |
| 5.174203100462206 | 1.645 | 1.299 | 1.432 |
| 5.177344693115796 | 1.646 | 1.3 | 1.432 |
| 5.180486285769386 | 1.648 | 1.3 | 1.432 |
| 5.183627878422976 | 1.649 | 1.301 | 1.432 |
| 5.186769471076565 | 1.65 | 1.301 | 1.432 |
| 5.189911063730155 | 1.651 | 1.302 | 1.432 |
| 5.193052656383744 | 1.653 | 1.303 | 1.432 |
| 5.196194249037334 | 1.654 | 1.303 | 1.432 |
| 5.199335841690924 | 1.655 | 1.304 | 1.432 |
| 5.202477434344513 | 1.656 | 1.305 | 1.432 |
| 5.205619026998103 | 1.657 | 1.305 | 1.432 |
| 5.208760619651692 | 1.659 | 1.306 | 1.432 |
| 5.211902212305282 | 1.66 | 1.307 | 1.432 |
| 5.215043804958871 | 1.661 | 1.308 | 1.432 |
| 5.218185397612461 | 1.662 | 1.309 | 1.432 |
| 5.221326990266051 | 1.663 | 1.309 | 1.432 |
| 5.22446858291964 | 1.664 | 1.31 | 1.432 |
| 5.22761017557323 | 1.665 | 1.311 | 1.432 |
| 5.23075176822682 | 1.666 | 1.312 | 1.432 |
| 5.23389336088041 | 1.667 | 1.313 | 1.432 |
| 5.237034953533999 | 1.668 | 1.314 | 1.432 |
| 5.240176546187588 | 1.669 | 1.315 | 1.432 |
| 5.243318138841178 | 1.67 | 1.316 | 1.432 |
| 5.246459731494767 | 1.671 | 1.317 | 1.432 |
| 5.249601324148357 | 1.672 | 1.318 | 1.432 |
| 5.252742916801947 | 1.673 | 1.319 | 1.432 |
| 5.255884509455536 | 1.674 | 1.321 | 1.432 |
| 5.259026102109125 | 1.675 | 1.322 | 1.432 |
| 5.262167694762715 | 1.675 | 1.323 | 1.432 |
| 5.265309287416305 | 1.676 | 1.324 | 1.432 |
| 5.268450880069895 | 1.677 | 1.326 | 1.432 |
| 5.271592472723484 | 1.678 | 1.327 | 1.432 |
| 5.274734065377074 | 1.679 | 1.328 | 1.432 |
| 5.277875658030664 | 1.68 | 1.33 | 1.432 |
| 5.281017250684253 | 1.68 | 1.331 | 1.432 |
| 5.284158843337843 | 1.681 | 1.333 | 1.432 |
| 5.287300435991432 | 1.682 | 1.334 | 1.432 |
| 5.290442028645022 | 1.683 | 1.336 | 1.432 |
| 5.293583621298612 | 1.684 | 1.337 | 1.432 |
| 5.296725213952201 | 1.684 | 1.339 | 1.432 |
| 5.299866806605791 | 1.685 | 1.34 | 1.432 |
| 5.30300839925938 | 1.686 | 1.342 | 1.432 |
| 5.30614999191297 | 1.686 | 1.344 | 1.432 |
| 5.30929158456656 | 1.687 | 1.346 | 1.432 |
| 5.312433177220149 | 1.688 | 1.347 | 1.432 |
| 5.315574769873739 | 1.689 | 1.349 | 1.432 |
| 5.318716362527328 | 1.689 | 1.351 | 1.432 |
| 5.321857955180918 | 1.69 | 1.353 | 1.432 |
| 5.324999547834508 | 1.69 | 1.355 | 1.432 |
| 5.328141140488097 | 1.691 | 1.357 | 1.432 |
| 5.331282733141686 | 1.692 | 1.359 | 1.432 |
| 5.334424325795276 | 1.692 | 1.361 | 1.432 |
| 5.337565918448866 | 1.693 | 1.363 | 1.432 |
| 5.340707511102456 | 1.693 | 1.365 | 1.432 |
| 5.343849103756045 | 1.694 | 1.367 | 1.432 |
| 5.346990696409634 | 1.695 | 1.369 | 1.432 |
| 5.350132289063224 | 1.695 | 1.371 | 1.432 |
| 5.353273881716814 | 1.696 | 1.373 | 1.432 |
| 5.356415474370403 | 1.696 | 1.376 | 1.432 |
| 5.359557067023993 | 1.697 | 1.378 | 1.432 |
| 5.362698659677583 | 1.697 | 1.38 | 1.432 |
| 5.365840252331172 | 1.698 | 1.383 | 1.432 |
| 5.368981844984762 | 1.698 | 1.385 | 1.432 |
| 5.372123437638351 | 1.699 | 1.388 | 1.432 |
| 5.375265030291941 | 1.699 | 1.39 | 1.432 |
| 5.378406622945531 | 1.7 | 1.392 | 1.432 |
| 5.38154821559912 | 1.7 | 1.395 | 1.432 |
| 5.38468980825271 | 1.701 | 1.398 | 1.432 |
| 5.387831400906299 | 1.701 | 1.4 | 1.432 |
| 5.39097299355989 | 1.701 | 1.403 | 1.432 |
| 5.394114586213479 | 1.702 | 1.405 | 1.432 |
| 5.397256178867068 | 1.702 | 1.408 | 1.432 |
| 5.400397771520657 | 1.703 | 1.411 | 1.432 |
| 5.403539364174247 | 1.703 | 1.413 | 1.432 |
| 5.406680956827837 | 1.703 | 1.416 | 1.432 |
| 5.409822549481426 | 1.704 | 1.419 | 1.432 |
| 5.412964142135016 | 1.704 | 1.422 | 1.432 |
| 5.416105734788605 | 1.705 | 1.424 | 1.432 |
| 5.419247327442195 | 1.705 | 1.427 | 1.432 |
| 5.422388920095785 | 1.705 | 1.43 | 1.432 |
| 5.425530512749375 | 1.706 | 1.433 | 1.432 |
| 5.428672105402964 | 1.706 | 1.436 | 1.432 |
| 5.431813698056554 | 1.706 | 1.439 | 1.432 |
| 5.434955290710143 | 1.707 | 1.442 | 1.432 |
| 5.438096883363733 | 1.707 | 1.445 | 1.432 |
| 5.441238476017322 | 1.707 | 1.448 | 1.432 |
| 5.444380068670912 | 1.708 | 1.451 | 1.432 |
| 5.447521661324502 | 1.708 | 1.454 | 1.432 |
| 5.450663253978091 | 1.708 | 1.457 | 1.432 |
| 5.453804846631681 | 1.708 | 1.46 | 1.432 |
| 5.456946439285271 | 1.709 | 1.463 | 1.432 |
| 5.46008803193886 | 1.709 | 1.466 | 1.432 |
| 5.46322962459245 | 1.709 | 1.469 | 1.432 |
| 5.466371217246039 | 1.709 | 1.472 | 1.433 |
| 5.46951280989963 | 1.71 | 1.475 | 1.433 |
| 5.472654402553218 | 1.71 | 1.478 | 1.433 |
| 5.475795995206808 | 1.71 | 1.481 | 1.433 |
| 5.478937587860398 | 1.71 | 1.484 | 1.433 |
| 5.482079180513987 | 1.711 | 1.488 | 1.433 |
| 5.485220773167577 | 1.711 | 1.491 | 1.433 |
| 5.488362365821166 | 1.711 | 1.494 | 1.433 |
| 5.491503958474756 | 1.711 | 1.497 | 1.433 |
| 5.494645551128346 | 1.711 | 1.5 | 1.434 |
| 5.497787143781935 | 1.712 | 1.503 | 1.434 |
| 5.500928736435525 | 1.712 | 1.506 | 1.434 |
| 5.504070329089115 | 1.712 | 1.51 | 1.434 |
| 5.507211921742704 | 1.712 | 1.513 | 1.435 |
| 5.510353514396294 | 1.712 | 1.516 | 1.435 |
| 5.513495107049883 | 1.713 | 1.519 | 1.435 |
| 5.516636699703473 | 1.713 | 1.522 | 1.435 |
| 5.519778292357062 | 1.713 | 1.525 | 1.436 |
| 5.522919885010652 | 1.713 | 1.528 | 1.436 |
| 5.526061477664242 | 1.713 | 1.531 | 1.436 |
| 5.529203070317831 | 1.713 | 1.535 | 1.437 |
| 5.532344662971421 | 1.714 | 1.538 | 1.437 |
| 5.535486255625011 | 1.714 | 1.541 | 1.438 |
| 5.5386278482786 | 1.714 | 1.544 | 1.438 |
| 5.54176944093219 | 1.714 | 1.547 | 1.438 |
| 5.544911033585779 | 1.714 | 1.55 | 1.439 |
| 5.54805262623937 | 1.714 | 1.553 | 1.44 |
| 5.551194218892959 | 1.714 | 1.556 | 1.44 |
| 5.554335811546548 | 1.714 | 1.559 | 1.441 |
| 5.557477404200137 | 1.715 | 1.562 | 1.441 |
| 5.560618996853727 | 1.715 | 1.565 | 1.442 |
| 5.563760589507317 | 1.715 | 1.568 | 1.443 |
| 5.566902182160906 | 1.715 | 1.571 | 1.443 |
| 5.570043774814496 | 1.715 | 1.574 | 1.444 |
| 5.573185367468086 | 1.715 | 1.576 | 1.445 |
| 5.576326960121675 | 1.715 | 1.579 | 1.446 |
| 5.579468552775264 | 1.715 | 1.582 | 1.447 |
| 5.582610145428854 | 1.715 | 1.585 | 1.448 |
| 5.585751738082444 | 1.716 | 1.588 | 1.449 |
| 5.588893330736034 | 1.716 | 1.591 | 1.45 |
| 5.592034923389623 | 1.716 | 1.593 | 1.451 |
| 5.595176516043213 | 1.716 | 1.596 | 1.452 |
| 5.598318108696803 | 1.716 | 1.599 | 1.453 |
| 5.601459701350392 | 1.716 | 1.601 | 1.454 |
| 5.604601294003982 | 1.716 | 1.604 | 1.456 |
| 5.607742886657571 | 1.716 | 1.607 | 1.457 |
| 5.610884479311161 | 1.716 | 1.609 | 1.458 |
| 5.61402607196475 | 1.716 | 1.612 | 1.46 |
| 5.61716766461834 | 1.716 | 1.614 | 1.461 |
| 5.62030925727193 | 1.716 | 1.617 | 1.463 |
| 5.623450849925519 | 1.716 | 1.619 | 1.464 |
| 5.626592442579109 | 1.716 | 1.621 | 1.466 |
| 5.629734035232698 | 1.717 | 1.624 | 1.467 |
| 5.632875627886288 | 1.717 | 1.626 | 1.469 |
| 5.636017220539878 | 1.717 | 1.629 | 1.471 |
| 5.639158813193467 | 1.717 | 1.631 | 1.473 |
| 5.642300405847057 | 1.717 | 1.633 | 1.475 |
| 5.645441998500646 | 1.717 | 1.635 | 1.476 |
| 5.648583591154236 | 1.717 | 1.638 | 1.478 |
| 5.651725183807825 | 1.717 | 1.64 | 1.48 |
| 5.654866776461415 | 1.717 | 1.642 | 1.483 |
| 5.658008369115005 | 1.717 | 1.644 | 1.485 |
| 5.661149961768594 | 1.717 | 1.646 | 1.487 |
| 5.664291554422184 | 1.717 | 1.648 | 1.489 |
| 5.667433147075774 | 1.717 | 1.65 | 1.491 |
| 5.670574739729363 | 1.717 | 1.652 | 1.494 |
| 5.673716332382953 | 1.717 | 1.654 | 1.496 |
| 5.676857925036542 | 1.717 | 1.656 | 1.499 |
| 5.679999517690132 | 1.717 | 1.658 | 1.501 |
| 5.683141110343721 | 1.717 | 1.659 | 1.504 |
| 5.686282702997311 | 1.717 | 1.661 | 1.506 |
| 5.689424295650901 | 1.717 | 1.663 | 1.509 |
| 5.69256588830449 | 1.717 | 1.665 | 1.511 |
| 5.69570748095808 | 1.717 | 1.666 | 1.514 |
| 5.69884907361167 | 1.717 | 1.668 | 1.517 |
| 5.701990666265259 | 1.717 | 1.669 | 1.52 |
| 5.705132258918849 | 1.718 | 1.671 | 1.522 |
| 5.708273851572438 | 1.718 | 1.673 | 1.525 |
| 5.711415444226028 | 1.718 | 1.674 | 1.528 |
| 5.714557036879618 | 1.718 | 1.675 | 1.531 |
| 5.717698629533207 | 1.718 | 1.677 | 1.534 |
| 5.720840222186797 | 1.718 | 1.678 | 1.537 |
| 5.723981814840386 | 1.718 | 1.68 | 1.54 |
| 5.727123407493976 | 1.718 | 1.681 | 1.543 |
| 5.730265000147565 | 1.718 | 1.682 | 1.546 |
| 5.733406592801155 | 1.718 | 1.684 | 1.549 |
| 5.736548185454744 | 1.718 | 1.685 | 1.552 |
| 5.739689778108334 | 1.718 | 1.686 | 1.555 |
| 5.742831370761924 | 1.718 | 1.687 | 1.558 |
| 5.745972963415514 | 1.718 | 1.688 | 1.561 |
| 5.749114556069103 | 1.718 | 1.689 | 1.564 |
| 5.752256148722693 | 1.718 | 1.69 | 1.568 |
| 5.755397741376282 | 1.718 | 1.692 | 1.571 |
| 5.758539334029872 | 1.718 | 1.693 | 1.574 |
| 5.761680926683462 | 1.718 | 1.694 | 1.577 |
| 5.764822519337051 | 1.718 | 1.694 | 1.58 |
| 5.767964111990641 | 1.718 | 1.695 | 1.583 |
| 5.77110570464423 | 1.718 | 1.696 | 1.586 |
| 5.77424729729782 | 1.718 | 1.697 | 1.59 |
| 5.77738888995141 | 1.718 | 1.698 | 1.593 |
| 5.780530482605 | 1.718 | 1.699 | 1.596 |
| 5.783672075258588 | 1.718 | 1.7 | 1.599 |
| 5.786813667912178 | 1.718 | 1.7 | 1.602 |
| 5.789955260565768 | 1.718 | 1.701 | 1.605 |
| 5.793096853219358 | 1.718 | 1.702 | 1.608 |
| 5.796238445872947 | 1.718 | 1.703 | 1.611 |
| 5.799380038526537 | 1.718 | 1.703 | 1.614 |
| 5.802521631180126 | 1.718 | 1.704 | 1.617 |
| 5.805663223833715 | 1.718 | 1.705 | 1.62 |
| 5.808804816487306 | 1.718 | 1.705 | 1.623 |
| 5.811946409140895 | 1.718 | 1.706 | 1.626 |
| 5.815088001794485 | 1.718 | 1.706 | 1.628 |
| 5.818229594448074 | 1.718 | 1.707 | 1.631 |
| 5.821371187101663 | 1.718 | 1.707 | 1.634 |
| 5.824512779755254 | 1.718 | 1.708 | 1.637 |
| 5.827654372408843 | 1.718 | 1.708 | 1.639 |
| 5.830795965062433 | 1.718 | 1.709 | 1.642 |
| 5.833937557716022 | 1.718 | 1.709 | 1.645 |
| 5.837079150369612 | 1.718 | 1.71 | 1.647 |
| 5.840220743023201 | 1.718 | 1.71 | 1.65 |
| 5.843362335676791 | 1.718 | 1.711 | 1.652 |
| 5.846503928330381 | 1.718 | 1.711 | 1.654 |
| 5.84964552098397 | 1.718 | 1.711 | 1.657 |
| 5.85278711363756 | 1.718 | 1.712 | 1.659 |
| 5.85592870629115 | 1.718 | 1.712 | 1.661 |
| 5.85907029894474 | 1.718 | 1.712 | 1.664 |
| 5.862211891598329 | 1.718 | 1.713 | 1.666 |
| 5.865353484251918 | 1.718 | 1.713 | 1.668 |
| 5.868495076905508 | 1.718 | 1.713 | 1.67 |
| 5.871636669559098 | 1.718 | 1.713 | 1.672 |
| 5.874778262212687 | 1.718 | 1.714 | 1.674 |
| 5.877919854866277 | 1.718 | 1.714 | 1.676 |
| 5.881061447519866 | 1.718 | 1.714 | 1.678 |
| 5.884203040173456 | 1.718 | 1.714 | 1.679 |
| 5.887344632827046 | 1.718 | 1.715 | 1.681 |
| 5.890486225480635 | 1.718 | 1.715 | 1.683 |
| 5.893627818134224 | 1.718 | 1.715 | 1.685 |
| 5.896769410787814 | 1.718 | 1.715 | 1.686 |
| 5.899911003441404 | 1.718 | 1.715 | 1.688 |
| 5.903052596094994 | 1.718 | 1.716 | 1.689 |
| 5.906194188748583 | 1.718 | 1.716 | 1.691 |
| 5.909335781402172 | 1.718 | 1.716 | 1.692 |
| 5.912477374055762 | 1.718 | 1.716 | 1.693 |
| 5.915618966709352 | 1.718 | 1.716 | 1.695 |
| 5.918760559362942 | 1.718 | 1.716 | 1.696 |
| 5.921902152016531 | 1.718 | 1.716 | 1.697 |
| 5.92504374467012 | 1.718 | 1.716 | 1.698 |
| 5.92818533732371 | 1.718 | 1.717 | 1.699 |
| 5.9313269299773 | 1.718 | 1.717 | 1.7 |
| 5.93446852263089 | 1.718 | 1.717 | 1.701 |
| 5.93761011528448 | 1.718 | 1.717 | 1.702 |
| 5.940751707938068 | 1.718 | 1.717 | 1.703 |
| 5.943893300591658 | 1.718 | 1.717 | 1.704 |
| 5.947034893245248 | 1.718 | 1.717 | 1.705 |
| 5.950176485898837 | 1.718 | 1.717 | 1.706 |
| 5.953318078552427 | 1.718 | 1.717 | 1.707 |
| 5.956459671206017 | 1.718 | 1.717 | 1.707 |
| 5.959601263859606 | 1.718 | 1.717 | 1.708 |
| 5.962742856513196 | 1.718 | 1.717 | 1.709 |
| 5.965884449166785 | 1.718 | 1.717 | 1.709 |
| 5.969026041820375 | 1.718 | 1.718 | 1.71 |
| 5.972167634473964 | 1.718 | 1.718 | 1.71 |
| 5.975309227127554 | 1.718 | 1.718 | 1.711 |
| 5.978450819781144 | 1.718 | 1.718 | 1.711 |
| 5.981592412434733 | 1.718 | 1.718 | 1.712 |
| 5.984734005088323 | 1.718 | 1.718 | 1.712 |
| 5.987875597741913 | 1.718 | 1.718 | 1.713 |
| 5.991017190395502 | 1.718 | 1.718 | 1.713 |
| 5.994158783049092 | 1.718 | 1.718 | 1.714 |
| 5.997300375702681 | 1.718 | 1.718 | 1.714 |
| 6.000441968356271 | 1.718 | 1.718 | 1.714 |
| 6.003583561009861 | 1.718 | 1.718 | 1.715 |
| 6.00672515366345 | 1.718 | 1.718 | 1.715 |
| 6.00986674631704 | 1.718 | 1.718 | 1.715 |
| 6.01300833897063 | 1.718 | 1.718 | 1.715 |
| 6.01614993162422 | 1.718 | 1.718 | 1.716 |
| 6.019291524277808 | 1.718 | 1.718 | 1.716 |
| 6.022433116931398 | 1.718 | 1.718 | 1.716 |
| 6.025574709584988 | 1.718 | 1.718 | 1.716 |
| 6.028716302238577 | 1.718 | 1.718 | 1.716 |
| 6.031857894892167 | 1.718 | 1.718 | 1.716 |
| 6.034999487545757 | 1.718 | 1.718 | 1.717 |
| 6.038141080199346 | 1.718 | 1.718 | 1.717 |
| 6.041282672852935 | 1.718 | 1.718 | 1.717 |
| 6.044424265506525 | 1.718 | 1.718 | 1.717 |
| 6.047565858160115 | 1.718 | 1.718 | 1.717 |
| 6.050707450813704 | 1.718 | 1.718 | 1.717 |
| 6.053849043467294 | 1.718 | 1.718 | 1.717 |
| 6.056990636120884 | 1.718 | 1.718 | 1.717 |
| 6.060132228774473 | 1.718 | 1.718 | 1.717 |
| 6.063273821428063 | 1.718 | 1.718 | 1.718 |
| 6.066415414081653 | 1.718 | 1.718 | 1.718 |
| 6.069557006735242 | 1.718 | 1.718 | 1.718 |
| 6.072698599388831 | 1.718 | 1.718 | 1.718 |
| 6.07584019204242 | 1.718 | 1.718 | 1.718 |
| 6.078981784696011 | 1.718 | 1.718 | 1.718 |
| 6.082123377349601 | 1.718 | 1.718 | 1.718 |
| 6.08526497000319 | 1.718 | 1.718 | 1.718 |
| 6.08840656265678 | 1.718 | 1.718 | 1.718 |
| 6.09154815531037 | 1.718 | 1.718 | 1.718 |
| 6.094689747963959 | 1.718 | 1.718 | 1.718 |
| 6.097831340617549 | 1.718 | 1.718 | 1.718 |
| 6.100972933271138 | 1.718 | 1.718 | 1.718 |
| 6.104114525924728 | 1.718 | 1.718 | 1.718 |
| 6.107256118578317 | 1.718 | 1.718 | 1.718 |
| 6.110397711231907 | 1.718 | 1.718 | 1.718 |
| 6.113539303885497 | 1.718 | 1.718 | 1.718 |
| 6.116680896539086 | 1.718 | 1.718 | 1.718 |
| 6.119822489192675 | 1.718 | 1.718 | 1.718 |
| 6.122964081846265 | 1.718 | 1.718 | 1.718 |
| 6.126105674499855 | 1.718 | 1.718 | 1.718 |
| 6.129247267153445 | 1.718 | 1.718 | 1.718 |
| 6.132388859807034 | 1.718 | 1.718 | 1.718 |
| 6.135530452460624 | 1.718 | 1.718 | 1.718 |
| 6.138672045114213 | 1.718 | 1.718 | 1.718 |
| 6.141813637767803 | 1.718 | 1.718 | 1.718 |
| 6.144955230421393 | 1.718 | 1.718 | 1.718 |
| 6.148096823074982 | 1.718 | 1.718 | 1.718 |
| 6.151238415728571 | 1.718 | 1.718 | 1.718 |
| 6.154380008382161 | 1.718 | 1.718 | 1.718 |
| 6.157521601035751 | 1.718 | 1.718 | 1.718 |
| 6.16066319368934 | 1.718 | 1.718 | 1.718 |
| 6.16380478634293 | 1.718 | 1.718 | 1.718 |
| 6.16694637899652 | 1.718 | 1.718 | 1.718 |
| 6.170087971650109 | 1.718 | 1.718 | 1.718 |
| 6.173229564303698 | 1.718 | 1.718 | 1.718 |
| 6.176371156957289 | 1.718 | 1.718 | 1.718 |
| 6.179512749610878 | 1.718 | 1.718 | 1.718 |
| 6.182654342264468 | 1.718 | 1.718 | 1.718 |
| 6.185795934918057 | 1.718 | 1.718 | 1.718 |
| 6.188937527571647 | 1.718 | 1.718 | 1.718 |
| 6.192079120225237 | 1.718 | 1.718 | 1.718 |
| 6.195220712878826 | 1.718 | 1.718 | 1.718 |
| 6.198362305532415 | 1.718 | 1.718 | 1.718 |
| 6.201503898186005 | 1.718 | 1.718 | 1.718 |
| 6.204645490839594 | 1.718 | 1.718 | 1.718 |
| 6.207787083493184 | 1.718 | 1.718 | 1.718 |
| 6.210928676146774 | 1.718 | 1.718 | 1.718 |
| 6.214070268800364 | 1.718 | 1.718 | 1.718 |
| 6.217211861453953 | 1.718 | 1.718 | 1.718 |
| 6.220353454107543 | 1.718 | 1.718 | 1.718 |
| 6.223495046761133 | 1.718 | 1.718 | 1.718 |
| 6.226636639414722 | 1.718 | 1.718 | 1.718 |
| 6.229778232068312 | 1.718 | 1.718 | 1.718 |
| 6.232919824721901 | 1.718 | 1.718 | 1.718 |
| 6.236061417375491 | 1.718 | 1.718 | 1.718 |
| 6.23920301002908 | 1.718 | 1.718 | 1.718 |
| 6.24234460268267 | 1.718 | 1.718 | 1.718 |
| 6.24548619533626 | 1.718 | 1.718 | 1.718 |
| 6.24862778798985 | 1.718 | 1.718 | 1.718 |
| 6.251769380643438 | 1.718 | 1.718 | 1.718 |
| 6.254910973297028 | 1.718 | 1.718 | 1.718 |
| 6.258052565950618 | 1.718 | 1.718 | 1.718 |
| 6.261194158604208 | 1.718 | 1.718 | 1.718 |
| 6.264335751257797 | 1.718 | 1.718 | 1.718 |
| 6.267477343911387 | 1.718 | 1.718 | 1.718 |
| 6.270618936564976 | 1.718 | 1.718 | 1.718 |
| 6.273760529218566 | 1.718 | 1.718 | 1.718 |
| 6.276902121872155 | 1.718 | 1.718 | 1.718 |
| 6.280043714525745 | 1.718 | 1.718 | 1.718 |
| 6.283185307179335 | 1.718 | 1.718 | 1.718 |